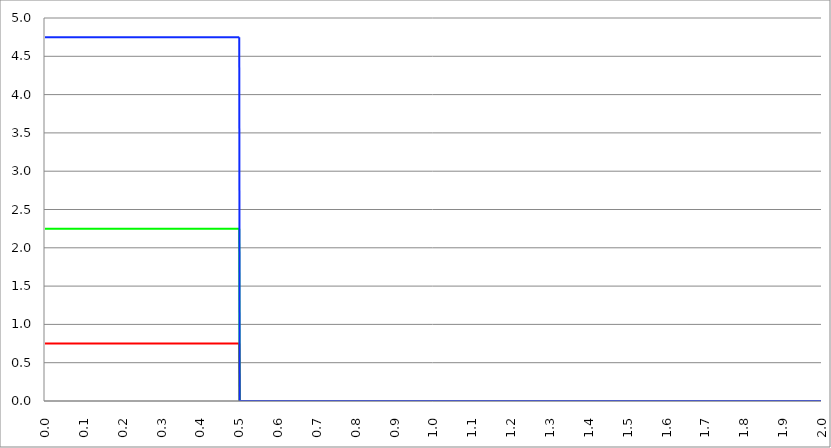
| Category | Series 1 | Series 0 | Series 2 |
|---|---|---|---|
| 0.0 | 0.75 | 2.25 | 4.75 |
| 0.001 | 0.75 | 2.25 | 4.75 |
| 0.002 | 0.75 | 2.25 | 4.75 |
| 0.003 | 0.75 | 2.25 | 4.75 |
| 0.004 | 0.75 | 2.25 | 4.75 |
| 0.005 | 0.75 | 2.25 | 4.75 |
| 0.006 | 0.75 | 2.25 | 4.75 |
| 0.007 | 0.75 | 2.25 | 4.75 |
| 0.008 | 0.75 | 2.25 | 4.75 |
| 0.009 | 0.75 | 2.25 | 4.75 |
| 0.01 | 0.75 | 2.25 | 4.75 |
| 0.011 | 0.75 | 2.25 | 4.75 |
| 0.012 | 0.75 | 2.25 | 4.75 |
| 0.013 | 0.75 | 2.25 | 4.75 |
| 0.014 | 0.75 | 2.25 | 4.75 |
| 0.015 | 0.75 | 2.25 | 4.75 |
| 0.016 | 0.75 | 2.25 | 4.75 |
| 0.017 | 0.75 | 2.25 | 4.75 |
| 0.018 | 0.75 | 2.25 | 4.75 |
| 0.019 | 0.75 | 2.25 | 4.75 |
| 0.02 | 0.75 | 2.25 | 4.75 |
| 0.021 | 0.75 | 2.25 | 4.75 |
| 0.022 | 0.75 | 2.25 | 4.75 |
| 0.023 | 0.75 | 2.25 | 4.75 |
| 0.024 | 0.75 | 2.25 | 4.75 |
| 0.025 | 0.75 | 2.25 | 4.75 |
| 0.026 | 0.75 | 2.25 | 4.75 |
| 0.027 | 0.75 | 2.25 | 4.75 |
| 0.028 | 0.75 | 2.25 | 4.75 |
| 0.029 | 0.75 | 2.25 | 4.75 |
| 0.03 | 0.75 | 2.25 | 4.75 |
| 0.031 | 0.75 | 2.25 | 4.75 |
| 0.032 | 0.75 | 2.25 | 4.75 |
| 0.033 | 0.75 | 2.25 | 4.75 |
| 0.034 | 0.75 | 2.25 | 4.75 |
| 0.035 | 0.75 | 2.25 | 4.75 |
| 0.036 | 0.75 | 2.25 | 4.75 |
| 0.037 | 0.75 | 2.25 | 4.75 |
| 0.038 | 0.75 | 2.25 | 4.75 |
| 0.039 | 0.75 | 2.25 | 4.75 |
| 0.04 | 0.75 | 2.25 | 4.75 |
| 0.041 | 0.75 | 2.25 | 4.75 |
| 0.042 | 0.75 | 2.25 | 4.75 |
| 0.043 | 0.75 | 2.25 | 4.75 |
| 0.044 | 0.75 | 2.25 | 4.75 |
| 0.045 | 0.75 | 2.25 | 4.75 |
| 0.046 | 0.75 | 2.25 | 4.75 |
| 0.047 | 0.75 | 2.25 | 4.75 |
| 0.048 | 0.75 | 2.25 | 4.75 |
| 0.049 | 0.75 | 2.25 | 4.75 |
| 0.05 | 0.75 | 2.25 | 4.75 |
| 0.051 | 0.75 | 2.25 | 4.75 |
| 0.052 | 0.75 | 2.25 | 4.75 |
| 0.053 | 0.75 | 2.25 | 4.75 |
| 0.054 | 0.75 | 2.25 | 4.75 |
| 0.055 | 0.75 | 2.25 | 4.75 |
| 0.056 | 0.75 | 2.25 | 4.75 |
| 0.057 | 0.75 | 2.25 | 4.75 |
| 0.058 | 0.75 | 2.25 | 4.75 |
| 0.059 | 0.75 | 2.25 | 4.75 |
| 0.06 | 0.75 | 2.25 | 4.75 |
| 0.061 | 0.75 | 2.25 | 4.75 |
| 0.062 | 0.75 | 2.25 | 4.75 |
| 0.063 | 0.75 | 2.25 | 4.75 |
| 0.064 | 0.75 | 2.25 | 4.75 |
| 0.065 | 0.75 | 2.25 | 4.75 |
| 0.066 | 0.75 | 2.25 | 4.75 |
| 0.067 | 0.75 | 2.25 | 4.75 |
| 0.068 | 0.75 | 2.25 | 4.75 |
| 0.069 | 0.75 | 2.25 | 4.75 |
| 0.07 | 0.75 | 2.25 | 4.75 |
| 0.071 | 0.75 | 2.25 | 4.75 |
| 0.072 | 0.75 | 2.25 | 4.75 |
| 0.073 | 0.75 | 2.25 | 4.75 |
| 0.074 | 0.75 | 2.25 | 4.75 |
| 0.075 | 0.75 | 2.25 | 4.75 |
| 0.076 | 0.75 | 2.25 | 4.75 |
| 0.077 | 0.75 | 2.25 | 4.75 |
| 0.078 | 0.75 | 2.25 | 4.75 |
| 0.079 | 0.75 | 2.25 | 4.75 |
| 0.08 | 0.75 | 2.25 | 4.75 |
| 0.081 | 0.75 | 2.25 | 4.75 |
| 0.082 | 0.75 | 2.25 | 4.75 |
| 0.083 | 0.75 | 2.25 | 4.75 |
| 0.084 | 0.75 | 2.25 | 4.75 |
| 0.085 | 0.75 | 2.25 | 4.75 |
| 0.086 | 0.75 | 2.25 | 4.75 |
| 0.087 | 0.75 | 2.25 | 4.75 |
| 0.088 | 0.75 | 2.25 | 4.75 |
| 0.089 | 0.75 | 2.25 | 4.75 |
| 0.09 | 0.75 | 2.25 | 4.75 |
| 0.091 | 0.75 | 2.25 | 4.75 |
| 0.092 | 0.75 | 2.25 | 4.75 |
| 0.093 | 0.75 | 2.25 | 4.75 |
| 0.094 | 0.75 | 2.25 | 4.75 |
| 0.095 | 0.75 | 2.25 | 4.75 |
| 0.096 | 0.75 | 2.25 | 4.75 |
| 0.097 | 0.75 | 2.25 | 4.75 |
| 0.098 | 0.75 | 2.25 | 4.75 |
| 0.099 | 0.75 | 2.25 | 4.75 |
| 0.1 | 0.75 | 2.25 | 4.75 |
| 0.101 | 0.75 | 2.25 | 4.75 |
| 0.102 | 0.75 | 2.25 | 4.75 |
| 0.103 | 0.75 | 2.25 | 4.75 |
| 0.104 | 0.75 | 2.25 | 4.75 |
| 0.105 | 0.75 | 2.25 | 4.75 |
| 0.106 | 0.75 | 2.25 | 4.75 |
| 0.107 | 0.75 | 2.25 | 4.75 |
| 0.108 | 0.75 | 2.25 | 4.75 |
| 0.109 | 0.75 | 2.25 | 4.75 |
| 0.11 | 0.75 | 2.25 | 4.75 |
| 0.111 | 0.75 | 2.25 | 4.75 |
| 0.112 | 0.75 | 2.25 | 4.75 |
| 0.113 | 0.75 | 2.25 | 4.75 |
| 0.114 | 0.75 | 2.25 | 4.75 |
| 0.115 | 0.75 | 2.25 | 4.75 |
| 0.116 | 0.75 | 2.25 | 4.75 |
| 0.117 | 0.75 | 2.25 | 4.75 |
| 0.118 | 0.75 | 2.25 | 4.75 |
| 0.119 | 0.75 | 2.25 | 4.75 |
| 0.12 | 0.75 | 2.25 | 4.75 |
| 0.121 | 0.75 | 2.25 | 4.75 |
| 0.122 | 0.75 | 2.25 | 4.75 |
| 0.123 | 0.75 | 2.25 | 4.75 |
| 0.124 | 0.75 | 2.25 | 4.75 |
| 0.125 | 0.75 | 2.25 | 4.75 |
| 0.126 | 0.75 | 2.25 | 4.75 |
| 0.127 | 0.75 | 2.25 | 4.75 |
| 0.128 | 0.75 | 2.25 | 4.75 |
| 0.129 | 0.75 | 2.25 | 4.75 |
| 0.13 | 0.75 | 2.25 | 4.75 |
| 0.131 | 0.75 | 2.25 | 4.75 |
| 0.132 | 0.75 | 2.25 | 4.75 |
| 0.133 | 0.75 | 2.25 | 4.75 |
| 0.134 | 0.75 | 2.25 | 4.75 |
| 0.135 | 0.75 | 2.25 | 4.75 |
| 0.136 | 0.75 | 2.25 | 4.75 |
| 0.137 | 0.75 | 2.25 | 4.75 |
| 0.138 | 0.75 | 2.25 | 4.75 |
| 0.139 | 0.75 | 2.25 | 4.75 |
| 0.14 | 0.75 | 2.25 | 4.75 |
| 0.141 | 0.75 | 2.25 | 4.75 |
| 0.142 | 0.75 | 2.25 | 4.75 |
| 0.143 | 0.75 | 2.25 | 4.75 |
| 0.144 | 0.75 | 2.25 | 4.75 |
| 0.145 | 0.75 | 2.25 | 4.75 |
| 0.146 | 0.75 | 2.25 | 4.75 |
| 0.147 | 0.75 | 2.25 | 4.75 |
| 0.148 | 0.75 | 2.25 | 4.75 |
| 0.149 | 0.75 | 2.25 | 4.75 |
| 0.15 | 0.75 | 2.25 | 4.75 |
| 0.151 | 0.75 | 2.25 | 4.75 |
| 0.152 | 0.75 | 2.25 | 4.75 |
| 0.153 | 0.75 | 2.25 | 4.75 |
| 0.154 | 0.75 | 2.25 | 4.75 |
| 0.155 | 0.75 | 2.25 | 4.75 |
| 0.156 | 0.75 | 2.25 | 4.75 |
| 0.157 | 0.75 | 2.25 | 4.75 |
| 0.158 | 0.75 | 2.25 | 4.75 |
| 0.159 | 0.75 | 2.25 | 4.75 |
| 0.16 | 0.75 | 2.25 | 4.75 |
| 0.161 | 0.75 | 2.25 | 4.75 |
| 0.162 | 0.75 | 2.25 | 4.75 |
| 0.163 | 0.75 | 2.25 | 4.75 |
| 0.164 | 0.75 | 2.25 | 4.75 |
| 0.165 | 0.75 | 2.25 | 4.75 |
| 0.166 | 0.75 | 2.25 | 4.75 |
| 0.167 | 0.75 | 2.25 | 4.75 |
| 0.168 | 0.75 | 2.25 | 4.75 |
| 0.169 | 0.75 | 2.25 | 4.75 |
| 0.17 | 0.75 | 2.25 | 4.75 |
| 0.171 | 0.75 | 2.25 | 4.75 |
| 0.172 | 0.75 | 2.25 | 4.75 |
| 0.173 | 0.75 | 2.25 | 4.75 |
| 0.174 | 0.75 | 2.25 | 4.75 |
| 0.175 | 0.75 | 2.25 | 4.75 |
| 0.176 | 0.75 | 2.25 | 4.75 |
| 0.177 | 0.75 | 2.25 | 4.75 |
| 0.178 | 0.75 | 2.25 | 4.75 |
| 0.179 | 0.75 | 2.25 | 4.75 |
| 0.18 | 0.75 | 2.25 | 4.75 |
| 0.181 | 0.75 | 2.25 | 4.75 |
| 0.182 | 0.75 | 2.25 | 4.75 |
| 0.183 | 0.75 | 2.25 | 4.75 |
| 0.184 | 0.75 | 2.25 | 4.75 |
| 0.185 | 0.75 | 2.25 | 4.75 |
| 0.186 | 0.75 | 2.25 | 4.75 |
| 0.187 | 0.75 | 2.25 | 4.75 |
| 0.188 | 0.75 | 2.25 | 4.75 |
| 0.189 | 0.75 | 2.25 | 4.75 |
| 0.19 | 0.75 | 2.25 | 4.75 |
| 0.191 | 0.75 | 2.25 | 4.75 |
| 0.192 | 0.75 | 2.25 | 4.75 |
| 0.193 | 0.75 | 2.25 | 4.75 |
| 0.194 | 0.75 | 2.25 | 4.75 |
| 0.195 | 0.75 | 2.25 | 4.75 |
| 0.196 | 0.75 | 2.25 | 4.75 |
| 0.197 | 0.75 | 2.25 | 4.75 |
| 0.198 | 0.75 | 2.25 | 4.75 |
| 0.199 | 0.75 | 2.25 | 4.75 |
| 0.2 | 0.75 | 2.25 | 4.75 |
| 0.201 | 0.75 | 2.25 | 4.75 |
| 0.202 | 0.75 | 2.25 | 4.75 |
| 0.203 | 0.75 | 2.25 | 4.75 |
| 0.204 | 0.75 | 2.25 | 4.75 |
| 0.205 | 0.75 | 2.25 | 4.75 |
| 0.206 | 0.75 | 2.25 | 4.75 |
| 0.207 | 0.75 | 2.25 | 4.75 |
| 0.208 | 0.75 | 2.25 | 4.75 |
| 0.209 | 0.75 | 2.25 | 4.75 |
| 0.21 | 0.75 | 2.25 | 4.75 |
| 0.211 | 0.75 | 2.25 | 4.75 |
| 0.212 | 0.75 | 2.25 | 4.75 |
| 0.213 | 0.75 | 2.25 | 4.75 |
| 0.214 | 0.75 | 2.25 | 4.75 |
| 0.215 | 0.75 | 2.25 | 4.75 |
| 0.216 | 0.75 | 2.25 | 4.75 |
| 0.217 | 0.75 | 2.25 | 4.75 |
| 0.218 | 0.75 | 2.25 | 4.75 |
| 0.219 | 0.75 | 2.25 | 4.75 |
| 0.22 | 0.75 | 2.25 | 4.75 |
| 0.221 | 0.75 | 2.25 | 4.75 |
| 0.222 | 0.75 | 2.25 | 4.75 |
| 0.223 | 0.75 | 2.25 | 4.75 |
| 0.224 | 0.75 | 2.25 | 4.75 |
| 0.225 | 0.75 | 2.25 | 4.75 |
| 0.226 | 0.75 | 2.25 | 4.75 |
| 0.227 | 0.75 | 2.25 | 4.75 |
| 0.228 | 0.75 | 2.25 | 4.75 |
| 0.229 | 0.75 | 2.25 | 4.75 |
| 0.23 | 0.75 | 2.25 | 4.75 |
| 0.231 | 0.75 | 2.25 | 4.75 |
| 0.232 | 0.75 | 2.25 | 4.75 |
| 0.233 | 0.75 | 2.25 | 4.75 |
| 0.234 | 0.75 | 2.25 | 4.75 |
| 0.235 | 0.75 | 2.25 | 4.75 |
| 0.236 | 0.75 | 2.25 | 4.75 |
| 0.237 | 0.75 | 2.25 | 4.75 |
| 0.238 | 0.75 | 2.25 | 4.75 |
| 0.239 | 0.75 | 2.25 | 4.75 |
| 0.24 | 0.75 | 2.25 | 4.75 |
| 0.241 | 0.75 | 2.25 | 4.75 |
| 0.242 | 0.75 | 2.25 | 4.75 |
| 0.243 | 0.75 | 2.25 | 4.75 |
| 0.244 | 0.75 | 2.25 | 4.75 |
| 0.245 | 0.75 | 2.25 | 4.75 |
| 0.246 | 0.75 | 2.25 | 4.75 |
| 0.247 | 0.75 | 2.25 | 4.75 |
| 0.248 | 0.75 | 2.25 | 4.75 |
| 0.249 | 0.75 | 2.25 | 4.75 |
| 0.25 | 0.75 | 2.25 | 4.75 |
| 0.251 | 0.75 | 2.25 | 4.75 |
| 0.252 | 0.75 | 2.25 | 4.75 |
| 0.253 | 0.75 | 2.25 | 4.75 |
| 0.254 | 0.75 | 2.25 | 4.75 |
| 0.255 | 0.75 | 2.25 | 4.75 |
| 0.256 | 0.75 | 2.25 | 4.75 |
| 0.257 | 0.75 | 2.25 | 4.75 |
| 0.258 | 0.75 | 2.25 | 4.75 |
| 0.259 | 0.75 | 2.25 | 4.75 |
| 0.26 | 0.75 | 2.25 | 4.75 |
| 0.261 | 0.75 | 2.25 | 4.75 |
| 0.262 | 0.75 | 2.25 | 4.75 |
| 0.263 | 0.75 | 2.25 | 4.75 |
| 0.264 | 0.75 | 2.25 | 4.75 |
| 0.265 | 0.75 | 2.25 | 4.75 |
| 0.266 | 0.75 | 2.25 | 4.75 |
| 0.267 | 0.75 | 2.25 | 4.75 |
| 0.268 | 0.75 | 2.25 | 4.75 |
| 0.269 | 0.75 | 2.25 | 4.75 |
| 0.27 | 0.75 | 2.25 | 4.75 |
| 0.271 | 0.75 | 2.25 | 4.75 |
| 0.272 | 0.75 | 2.25 | 4.75 |
| 0.273 | 0.75 | 2.25 | 4.75 |
| 0.274 | 0.75 | 2.25 | 4.75 |
| 0.275 | 0.75 | 2.25 | 4.75 |
| 0.276 | 0.75 | 2.25 | 4.75 |
| 0.277 | 0.75 | 2.25 | 4.75 |
| 0.278 | 0.75 | 2.25 | 4.75 |
| 0.279 | 0.75 | 2.25 | 4.75 |
| 0.28 | 0.75 | 2.25 | 4.75 |
| 0.281 | 0.75 | 2.25 | 4.75 |
| 0.282 | 0.75 | 2.25 | 4.75 |
| 0.283 | 0.75 | 2.25 | 4.75 |
| 0.284 | 0.75 | 2.25 | 4.75 |
| 0.285 | 0.75 | 2.25 | 4.75 |
| 0.286 | 0.75 | 2.25 | 4.75 |
| 0.287 | 0.75 | 2.25 | 4.75 |
| 0.288 | 0.75 | 2.25 | 4.75 |
| 0.289 | 0.75 | 2.25 | 4.75 |
| 0.29 | 0.75 | 2.25 | 4.75 |
| 0.291 | 0.75 | 2.25 | 4.75 |
| 0.292 | 0.75 | 2.25 | 4.75 |
| 0.293 | 0.75 | 2.25 | 4.75 |
| 0.294 | 0.75 | 2.25 | 4.75 |
| 0.295 | 0.75 | 2.25 | 4.75 |
| 0.296 | 0.75 | 2.25 | 4.75 |
| 0.297 | 0.75 | 2.25 | 4.75 |
| 0.298 | 0.75 | 2.25 | 4.75 |
| 0.299 | 0.75 | 2.25 | 4.75 |
| 0.3 | 0.75 | 2.25 | 4.75 |
| 0.301 | 0.75 | 2.25 | 4.75 |
| 0.302 | 0.75 | 2.25 | 4.75 |
| 0.303 | 0.75 | 2.25 | 4.75 |
| 0.304 | 0.75 | 2.25 | 4.75 |
| 0.305 | 0.75 | 2.25 | 4.75 |
| 0.306 | 0.75 | 2.25 | 4.75 |
| 0.307 | 0.75 | 2.25 | 4.75 |
| 0.308 | 0.75 | 2.25 | 4.75 |
| 0.309 | 0.75 | 2.25 | 4.75 |
| 0.31 | 0.75 | 2.25 | 4.75 |
| 0.311 | 0.75 | 2.25 | 4.75 |
| 0.312 | 0.75 | 2.25 | 4.75 |
| 0.313 | 0.75 | 2.25 | 4.75 |
| 0.314 | 0.75 | 2.25 | 4.75 |
| 0.315 | 0.75 | 2.25 | 4.75 |
| 0.316 | 0.75 | 2.25 | 4.75 |
| 0.317 | 0.75 | 2.25 | 4.75 |
| 0.318 | 0.75 | 2.25 | 4.75 |
| 0.319 | 0.75 | 2.25 | 4.75 |
| 0.32 | 0.75 | 2.25 | 4.75 |
| 0.321 | 0.75 | 2.25 | 4.75 |
| 0.322 | 0.75 | 2.25 | 4.75 |
| 0.323 | 0.75 | 2.25 | 4.75 |
| 0.324 | 0.75 | 2.25 | 4.75 |
| 0.325 | 0.75 | 2.25 | 4.75 |
| 0.326 | 0.75 | 2.25 | 4.75 |
| 0.327 | 0.75 | 2.25 | 4.75 |
| 0.328 | 0.75 | 2.25 | 4.75 |
| 0.329 | 0.75 | 2.25 | 4.75 |
| 0.33 | 0.75 | 2.25 | 4.75 |
| 0.331 | 0.75 | 2.25 | 4.75 |
| 0.332 | 0.75 | 2.25 | 4.75 |
| 0.333 | 0.75 | 2.25 | 4.75 |
| 0.334 | 0.75 | 2.25 | 4.75 |
| 0.335 | 0.75 | 2.25 | 4.75 |
| 0.336 | 0.75 | 2.25 | 4.75 |
| 0.337 | 0.75 | 2.25 | 4.75 |
| 0.338 | 0.75 | 2.25 | 4.75 |
| 0.339 | 0.75 | 2.25 | 4.75 |
| 0.34 | 0.75 | 2.25 | 4.75 |
| 0.341 | 0.75 | 2.25 | 4.75 |
| 0.342 | 0.75 | 2.25 | 4.75 |
| 0.343 | 0.75 | 2.25 | 4.75 |
| 0.344 | 0.75 | 2.25 | 4.75 |
| 0.345 | 0.75 | 2.25 | 4.75 |
| 0.346 | 0.75 | 2.25 | 4.75 |
| 0.347 | 0.75 | 2.25 | 4.75 |
| 0.348 | 0.75 | 2.25 | 4.75 |
| 0.349 | 0.75 | 2.25 | 4.75 |
| 0.35 | 0.75 | 2.25 | 4.75 |
| 0.351 | 0.75 | 2.25 | 4.75 |
| 0.352 | 0.75 | 2.25 | 4.75 |
| 0.353 | 0.75 | 2.25 | 4.75 |
| 0.354 | 0.75 | 2.25 | 4.75 |
| 0.355 | 0.75 | 2.25 | 4.75 |
| 0.356 | 0.75 | 2.25 | 4.75 |
| 0.357 | 0.75 | 2.25 | 4.75 |
| 0.358 | 0.75 | 2.25 | 4.75 |
| 0.359 | 0.75 | 2.25 | 4.75 |
| 0.36 | 0.75 | 2.25 | 4.75 |
| 0.361 | 0.75 | 2.25 | 4.75 |
| 0.362 | 0.75 | 2.25 | 4.75 |
| 0.363 | 0.75 | 2.25 | 4.75 |
| 0.364 | 0.75 | 2.25 | 4.75 |
| 0.365 | 0.75 | 2.25 | 4.75 |
| 0.366 | 0.75 | 2.25 | 4.75 |
| 0.367 | 0.75 | 2.25 | 4.75 |
| 0.368 | 0.75 | 2.25 | 4.75 |
| 0.369 | 0.75 | 2.25 | 4.75 |
| 0.37 | 0.75 | 2.25 | 4.75 |
| 0.371 | 0.75 | 2.25 | 4.75 |
| 0.372 | 0.75 | 2.25 | 4.75 |
| 0.373 | 0.75 | 2.25 | 4.75 |
| 0.374 | 0.75 | 2.25 | 4.75 |
| 0.375 | 0.75 | 2.25 | 4.75 |
| 0.376 | 0.75 | 2.25 | 4.75 |
| 0.377 | 0.75 | 2.25 | 4.75 |
| 0.378 | 0.75 | 2.25 | 4.75 |
| 0.379 | 0.75 | 2.25 | 4.75 |
| 0.38 | 0.75 | 2.25 | 4.75 |
| 0.381 | 0.75 | 2.25 | 4.75 |
| 0.382 | 0.75 | 2.25 | 4.75 |
| 0.383 | 0.75 | 2.25 | 4.75 |
| 0.384 | 0.75 | 2.25 | 4.75 |
| 0.385 | 0.75 | 2.25 | 4.75 |
| 0.386 | 0.75 | 2.25 | 4.75 |
| 0.387 | 0.75 | 2.25 | 4.75 |
| 0.388 | 0.75 | 2.25 | 4.75 |
| 0.389 | 0.75 | 2.25 | 4.75 |
| 0.39 | 0.75 | 2.25 | 4.75 |
| 0.391 | 0.75 | 2.25 | 4.75 |
| 0.392 | 0.75 | 2.25 | 4.75 |
| 0.393 | 0.75 | 2.25 | 4.75 |
| 0.394 | 0.75 | 2.25 | 4.75 |
| 0.395 | 0.75 | 2.25 | 4.75 |
| 0.396 | 0.75 | 2.25 | 4.75 |
| 0.397 | 0.75 | 2.25 | 4.75 |
| 0.398 | 0.75 | 2.25 | 4.75 |
| 0.399 | 0.75 | 2.25 | 4.75 |
| 0.4 | 0.75 | 2.25 | 4.75 |
| 0.401 | 0.75 | 2.25 | 4.75 |
| 0.402 | 0.75 | 2.25 | 4.75 |
| 0.403 | 0.75 | 2.25 | 4.75 |
| 0.404 | 0.75 | 2.25 | 4.75 |
| 0.405 | 0.75 | 2.25 | 4.75 |
| 0.406 | 0.75 | 2.25 | 4.75 |
| 0.407 | 0.75 | 2.25 | 4.75 |
| 0.408 | 0.75 | 2.25 | 4.75 |
| 0.409 | 0.75 | 2.25 | 4.75 |
| 0.41 | 0.75 | 2.25 | 4.75 |
| 0.411 | 0.75 | 2.25 | 4.75 |
| 0.412 | 0.75 | 2.25 | 4.75 |
| 0.413 | 0.75 | 2.25 | 4.75 |
| 0.414 | 0.75 | 2.25 | 4.75 |
| 0.415 | 0.75 | 2.25 | 4.75 |
| 0.416 | 0.75 | 2.25 | 4.75 |
| 0.417 | 0.75 | 2.25 | 4.75 |
| 0.418 | 0.75 | 2.25 | 4.75 |
| 0.419 | 0.75 | 2.25 | 4.75 |
| 0.42 | 0.75 | 2.25 | 4.75 |
| 0.421 | 0.75 | 2.25 | 4.75 |
| 0.422 | 0.75 | 2.25 | 4.75 |
| 0.423 | 0.75 | 2.25 | 4.75 |
| 0.424 | 0.75 | 2.25 | 4.75 |
| 0.425 | 0.75 | 2.25 | 4.75 |
| 0.426 | 0.75 | 2.25 | 4.75 |
| 0.427 | 0.75 | 2.25 | 4.75 |
| 0.428 | 0.75 | 2.25 | 4.75 |
| 0.429 | 0.75 | 2.25 | 4.75 |
| 0.43 | 0.75 | 2.25 | 4.75 |
| 0.431 | 0.75 | 2.25 | 4.75 |
| 0.432 | 0.75 | 2.25 | 4.75 |
| 0.433 | 0.75 | 2.25 | 4.75 |
| 0.434 | 0.75 | 2.25 | 4.75 |
| 0.435 | 0.75 | 2.25 | 4.75 |
| 0.436 | 0.75 | 2.25 | 4.75 |
| 0.437 | 0.75 | 2.25 | 4.75 |
| 0.438 | 0.75 | 2.25 | 4.75 |
| 0.439 | 0.75 | 2.25 | 4.75 |
| 0.44 | 0.75 | 2.25 | 4.75 |
| 0.441 | 0.75 | 2.25 | 4.75 |
| 0.442 | 0.75 | 2.25 | 4.75 |
| 0.443 | 0.75 | 2.25 | 4.75 |
| 0.444 | 0.75 | 2.25 | 4.75 |
| 0.445 | 0.75 | 2.25 | 4.75 |
| 0.446 | 0.75 | 2.25 | 4.75 |
| 0.447 | 0.75 | 2.25 | 4.75 |
| 0.448 | 0.75 | 2.25 | 4.75 |
| 0.449 | 0.75 | 2.25 | 4.75 |
| 0.45 | 0.75 | 2.25 | 4.75 |
| 0.451 | 0.75 | 2.25 | 4.75 |
| 0.452 | 0.75 | 2.25 | 4.75 |
| 0.453 | 0.75 | 2.25 | 4.75 |
| 0.454 | 0.75 | 2.25 | 4.75 |
| 0.455 | 0.75 | 2.25 | 4.75 |
| 0.456 | 0.75 | 2.25 | 4.75 |
| 0.457 | 0.75 | 2.25 | 4.75 |
| 0.458 | 0.75 | 2.25 | 4.75 |
| 0.459 | 0.75 | 2.25 | 4.75 |
| 0.46 | 0.75 | 2.25 | 4.75 |
| 0.461 | 0.75 | 2.25 | 4.75 |
| 0.462 | 0.75 | 2.25 | 4.75 |
| 0.463 | 0.75 | 2.25 | 4.75 |
| 0.464 | 0.75 | 2.25 | 4.75 |
| 0.465 | 0.75 | 2.25 | 4.75 |
| 0.466 | 0.75 | 2.25 | 4.75 |
| 0.467 | 0.75 | 2.25 | 4.75 |
| 0.468 | 0.75 | 2.25 | 4.75 |
| 0.469 | 0.75 | 2.25 | 4.75 |
| 0.47 | 0.75 | 2.25 | 4.75 |
| 0.471 | 0.75 | 2.25 | 4.75 |
| 0.472 | 0.75 | 2.25 | 4.75 |
| 0.473 | 0.75 | 2.25 | 4.75 |
| 0.474 | 0.75 | 2.25 | 4.75 |
| 0.475 | 0.75 | 2.25 | 4.75 |
| 0.476 | 0.75 | 2.25 | 4.75 |
| 0.477 | 0.75 | 2.25 | 4.75 |
| 0.478 | 0.75 | 2.25 | 4.75 |
| 0.479 | 0.75 | 2.25 | 4.75 |
| 0.48 | 0.75 | 2.25 | 4.75 |
| 0.481 | 0.75 | 2.25 | 4.75 |
| 0.482 | 0.75 | 2.25 | 4.75 |
| 0.483 | 0.75 | 2.25 | 4.75 |
| 0.484 | 0.75 | 2.25 | 4.75 |
| 0.485 | 0.75 | 2.25 | 4.75 |
| 0.486 | 0.75 | 2.25 | 4.75 |
| 0.487 | 0.75 | 2.25 | 4.75 |
| 0.488 | 0.75 | 2.25 | 4.75 |
| 0.489 | 0.75 | 2.25 | 4.75 |
| 0.49 | 0.75 | 2.25 | 4.75 |
| 0.491 | 0.75 | 2.25 | 4.75 |
| 0.492 | 0.75 | 2.25 | 4.75 |
| 0.493 | 0.75 | 2.25 | 4.75 |
| 0.494 | 0.75 | 2.25 | 4.75 |
| 0.495 | 0.75 | 2.25 | 4.75 |
| 0.496 | 0.75 | 2.25 | 4.75 |
| 0.497 | 0.75 | 2.25 | 4.75 |
| 0.498 | 0.75 | 2.25 | 4.75 |
| 0.499 | 0.75 | 2.25 | 4.75 |
| 0.5 | 0.75 | 2.25 | 4.75 |
| 0.501 | 0 | 0 | 0 |
| 0.502 | 0 | 0 | 0 |
| 0.503 | 0 | 0 | 0 |
| 0.504 | 0 | 0 | 0 |
| 0.505 | 0 | 0 | 0 |
| 0.506 | 0 | 0 | 0 |
| 0.507 | 0 | 0 | 0 |
| 0.508 | 0 | 0 | 0 |
| 0.509 | 0 | 0 | 0 |
| 0.51 | 0 | 0 | 0 |
| 0.511 | 0 | 0 | 0 |
| 0.512 | 0 | 0 | 0 |
| 0.513 | 0 | 0 | 0 |
| 0.514 | 0 | 0 | 0 |
| 0.515 | 0 | 0 | 0 |
| 0.516 | 0 | 0 | 0 |
| 0.517 | 0 | 0 | 0 |
| 0.518 | 0 | 0 | 0 |
| 0.519 | 0 | 0 | 0 |
| 0.52 | 0 | 0 | 0 |
| 0.521 | 0 | 0 | 0 |
| 0.522 | 0 | 0 | 0 |
| 0.523 | 0 | 0 | 0 |
| 0.524 | 0 | 0 | 0 |
| 0.525 | 0 | 0 | 0 |
| 0.526 | 0 | 0 | 0 |
| 0.527 | 0 | 0 | 0 |
| 0.528 | 0 | 0 | 0 |
| 0.529 | 0 | 0 | 0 |
| 0.53 | 0 | 0 | 0 |
| 0.531 | 0 | 0 | 0 |
| 0.532 | 0 | 0 | 0 |
| 0.533 | 0 | 0 | 0 |
| 0.534 | 0 | 0 | 0 |
| 0.535 | 0 | 0 | 0 |
| 0.536 | 0 | 0 | 0 |
| 0.537 | 0 | 0 | 0 |
| 0.538 | 0 | 0 | 0 |
| 0.539 | 0 | 0 | 0 |
| 0.54 | 0 | 0 | 0 |
| 0.541 | 0 | 0 | 0 |
| 0.542 | 0 | 0 | 0 |
| 0.543 | 0 | 0 | 0 |
| 0.544 | 0 | 0 | 0 |
| 0.545 | 0 | 0 | 0 |
| 0.546 | 0 | 0 | 0 |
| 0.547 | 0 | 0 | 0 |
| 0.548 | 0 | 0 | 0 |
| 0.549 | 0 | 0 | 0 |
| 0.55 | 0 | 0 | 0 |
| 0.551 | 0 | 0 | 0 |
| 0.552 | 0 | 0 | 0 |
| 0.553 | 0 | 0 | 0 |
| 0.554 | 0 | 0 | 0 |
| 0.555 | 0 | 0 | 0 |
| 0.556 | 0 | 0 | 0 |
| 0.557 | 0 | 0 | 0 |
| 0.558 | 0 | 0 | 0 |
| 0.559 | 0 | 0 | 0 |
| 0.56 | 0 | 0 | 0 |
| 0.561 | 0 | 0 | 0 |
| 0.562 | 0 | 0 | 0 |
| 0.563 | 0 | 0 | 0 |
| 0.564 | 0 | 0 | 0 |
| 0.565 | 0 | 0 | 0 |
| 0.566 | 0 | 0 | 0 |
| 0.567 | 0 | 0 | 0 |
| 0.568 | 0 | 0 | 0 |
| 0.569 | 0 | 0 | 0 |
| 0.57 | 0 | 0 | 0 |
| 0.571 | 0 | 0 | 0 |
| 0.572 | 0 | 0 | 0 |
| 0.573 | 0 | 0 | 0 |
| 0.574 | 0 | 0 | 0 |
| 0.575 | 0 | 0 | 0 |
| 0.576 | 0 | 0 | 0 |
| 0.577 | 0 | 0 | 0 |
| 0.578 | 0 | 0 | 0 |
| 0.579 | 0 | 0 | 0 |
| 0.58 | 0 | 0 | 0 |
| 0.581 | 0 | 0 | 0 |
| 0.582 | 0 | 0 | 0 |
| 0.583 | 0 | 0 | 0 |
| 0.584 | 0 | 0 | 0 |
| 0.585 | 0 | 0 | 0 |
| 0.586 | 0 | 0 | 0 |
| 0.587 | 0 | 0 | 0 |
| 0.588 | 0 | 0 | 0 |
| 0.589 | 0 | 0 | 0 |
| 0.59 | 0 | 0 | 0 |
| 0.591 | 0 | 0 | 0 |
| 0.592 | 0 | 0 | 0 |
| 0.593 | 0 | 0 | 0 |
| 0.594 | 0 | 0 | 0 |
| 0.595 | 0 | 0 | 0 |
| 0.596 | 0 | 0 | 0 |
| 0.597 | 0 | 0 | 0 |
| 0.598 | 0 | 0 | 0 |
| 0.599 | 0 | 0 | 0 |
| 0.6 | 0 | 0 | 0 |
| 0.601 | 0 | 0 | 0 |
| 0.602 | 0 | 0 | 0 |
| 0.603 | 0 | 0 | 0 |
| 0.604 | 0 | 0 | 0 |
| 0.605 | 0 | 0 | 0 |
| 0.606 | 0 | 0 | 0 |
| 0.607 | 0 | 0 | 0 |
| 0.608 | 0 | 0 | 0 |
| 0.609 | 0 | 0 | 0 |
| 0.61 | 0 | 0 | 0 |
| 0.611 | 0 | 0 | 0 |
| 0.612 | 0 | 0 | 0 |
| 0.613 | 0 | 0 | 0 |
| 0.614 | 0 | 0 | 0 |
| 0.615 | 0 | 0 | 0 |
| 0.616 | 0 | 0 | 0 |
| 0.617 | 0 | 0 | 0 |
| 0.618 | 0 | 0 | 0 |
| 0.619 | 0 | 0 | 0 |
| 0.62 | 0 | 0 | 0 |
| 0.621 | 0 | 0 | 0 |
| 0.622 | 0 | 0 | 0 |
| 0.623 | 0 | 0 | 0 |
| 0.624 | 0 | 0 | 0 |
| 0.625 | 0 | 0 | 0 |
| 0.626 | 0 | 0 | 0 |
| 0.627 | 0 | 0 | 0 |
| 0.628 | 0 | 0 | 0 |
| 0.629 | 0 | 0 | 0 |
| 0.63 | 0 | 0 | 0 |
| 0.631 | 0 | 0 | 0 |
| 0.632 | 0 | 0 | 0 |
| 0.633 | 0 | 0 | 0 |
| 0.634 | 0 | 0 | 0 |
| 0.635 | 0 | 0 | 0 |
| 0.636 | 0 | 0 | 0 |
| 0.637 | 0 | 0 | 0 |
| 0.638 | 0 | 0 | 0 |
| 0.639 | 0 | 0 | 0 |
| 0.64 | 0 | 0 | 0 |
| 0.641 | 0 | 0 | 0 |
| 0.642 | 0 | 0 | 0 |
| 0.643 | 0 | 0 | 0 |
| 0.644 | 0 | 0 | 0 |
| 0.645 | 0 | 0 | 0 |
| 0.646 | 0 | 0 | 0 |
| 0.647 | 0 | 0 | 0 |
| 0.648 | 0 | 0 | 0 |
| 0.649 | 0 | 0 | 0 |
| 0.65 | 0 | 0 | 0 |
| 0.651 | 0 | 0 | 0 |
| 0.652 | 0 | 0 | 0 |
| 0.653 | 0 | 0 | 0 |
| 0.654 | 0 | 0 | 0 |
| 0.655 | 0 | 0 | 0 |
| 0.656 | 0 | 0 | 0 |
| 0.657 | 0 | 0 | 0 |
| 0.658 | 0 | 0 | 0 |
| 0.659 | 0 | 0 | 0 |
| 0.66 | 0 | 0 | 0 |
| 0.661 | 0 | 0 | 0 |
| 0.662 | 0 | 0 | 0 |
| 0.663 | 0 | 0 | 0 |
| 0.664 | 0 | 0 | 0 |
| 0.665 | 0 | 0 | 0 |
| 0.666 | 0 | 0 | 0 |
| 0.667 | 0 | 0 | 0 |
| 0.668 | 0 | 0 | 0 |
| 0.669 | 0 | 0 | 0 |
| 0.67 | 0 | 0 | 0 |
| 0.671 | 0 | 0 | 0 |
| 0.672 | 0 | 0 | 0 |
| 0.673 | 0 | 0 | 0 |
| 0.674 | 0 | 0 | 0 |
| 0.675 | 0 | 0 | 0 |
| 0.676 | 0 | 0 | 0 |
| 0.677 | 0 | 0 | 0 |
| 0.678 | 0 | 0 | 0 |
| 0.679 | 0 | 0 | 0 |
| 0.68 | 0 | 0 | 0 |
| 0.681 | 0 | 0 | 0 |
| 0.682 | 0 | 0 | 0 |
| 0.683 | 0 | 0 | 0 |
| 0.684 | 0 | 0 | 0 |
| 0.685 | 0 | 0 | 0 |
| 0.686 | 0 | 0 | 0 |
| 0.687 | 0 | 0 | 0 |
| 0.688 | 0 | 0 | 0 |
| 0.689 | 0 | 0 | 0 |
| 0.69 | 0 | 0 | 0 |
| 0.691 | 0 | 0 | 0 |
| 0.692 | 0 | 0 | 0 |
| 0.693 | 0 | 0 | 0 |
| 0.694 | 0 | 0 | 0 |
| 0.695 | 0 | 0 | 0 |
| 0.696 | 0 | 0 | 0 |
| 0.697 | 0 | 0 | 0 |
| 0.698 | 0 | 0 | 0 |
| 0.699 | 0 | 0 | 0 |
| 0.7 | 0 | 0 | 0 |
| 0.701 | 0 | 0 | 0 |
| 0.702 | 0 | 0 | 0 |
| 0.703 | 0 | 0 | 0 |
| 0.704 | 0 | 0 | 0 |
| 0.705 | 0 | 0 | 0 |
| 0.706 | 0 | 0 | 0 |
| 0.707 | 0 | 0 | 0 |
| 0.708 | 0 | 0 | 0 |
| 0.709 | 0 | 0 | 0 |
| 0.71 | 0 | 0 | 0 |
| 0.711 | 0 | 0 | 0 |
| 0.712 | 0 | 0 | 0 |
| 0.713 | 0 | 0 | 0 |
| 0.714 | 0 | 0 | 0 |
| 0.715 | 0 | 0 | 0 |
| 0.716 | 0 | 0 | 0 |
| 0.717 | 0 | 0 | 0 |
| 0.718 | 0 | 0 | 0 |
| 0.719 | 0 | 0 | 0 |
| 0.72 | 0 | 0 | 0 |
| 0.721 | 0 | 0 | 0 |
| 0.722 | 0 | 0 | 0 |
| 0.723 | 0 | 0 | 0 |
| 0.724 | 0 | 0 | 0 |
| 0.725 | 0 | 0 | 0 |
| 0.726 | 0 | 0 | 0 |
| 0.727 | 0 | 0 | 0 |
| 0.728 | 0 | 0 | 0 |
| 0.729 | 0 | 0 | 0 |
| 0.73 | 0 | 0 | 0 |
| 0.731 | 0 | 0 | 0 |
| 0.732 | 0 | 0 | 0 |
| 0.733 | 0 | 0 | 0 |
| 0.734 | 0 | 0 | 0 |
| 0.735 | 0 | 0 | 0 |
| 0.736 | 0 | 0 | 0 |
| 0.737 | 0 | 0 | 0 |
| 0.738 | 0 | 0 | 0 |
| 0.739 | 0 | 0 | 0 |
| 0.74 | 0 | 0 | 0 |
| 0.741 | 0 | 0 | 0 |
| 0.742 | 0 | 0 | 0 |
| 0.743 | 0 | 0 | 0 |
| 0.744 | 0 | 0 | 0 |
| 0.745 | 0 | 0 | 0 |
| 0.746 | 0 | 0 | 0 |
| 0.747 | 0 | 0 | 0 |
| 0.748 | 0 | 0 | 0 |
| 0.749 | 0 | 0 | 0 |
| 0.75 | 0 | 0 | 0 |
| 0.751 | 0 | 0 | 0 |
| 0.752 | 0 | 0 | 0 |
| 0.753 | 0 | 0 | 0 |
| 0.754 | 0 | 0 | 0 |
| 0.755 | 0 | 0 | 0 |
| 0.756 | 0 | 0 | 0 |
| 0.757 | 0 | 0 | 0 |
| 0.758 | 0 | 0 | 0 |
| 0.759 | 0 | 0 | 0 |
| 0.76 | 0 | 0 | 0 |
| 0.761 | 0 | 0 | 0 |
| 0.762 | 0 | 0 | 0 |
| 0.763 | 0 | 0 | 0 |
| 0.764 | 0 | 0 | 0 |
| 0.765 | 0 | 0 | 0 |
| 0.766 | 0 | 0 | 0 |
| 0.767 | 0 | 0 | 0 |
| 0.768 | 0 | 0 | 0 |
| 0.769 | 0 | 0 | 0 |
| 0.77 | 0 | 0 | 0 |
| 0.771000000000001 | 0 | 0 | 0 |
| 0.772000000000001 | 0 | 0 | 0 |
| 0.773000000000001 | 0 | 0 | 0 |
| 0.774000000000001 | 0 | 0 | 0 |
| 0.775000000000001 | 0 | 0 | 0 |
| 0.776000000000001 | 0 | 0 | 0 |
| 0.777000000000001 | 0 | 0 | 0 |
| 0.778000000000001 | 0 | 0 | 0 |
| 0.779000000000001 | 0 | 0 | 0 |
| 0.78 | 0 | 0 | 0 |
| 0.781000000000001 | 0 | 0 | 0 |
| 0.782000000000001 | 0 | 0 | 0 |
| 0.783000000000001 | 0 | 0 | 0 |
| 0.784000000000001 | 0 | 0 | 0 |
| 0.785000000000001 | 0 | 0 | 0 |
| 0.786000000000001 | 0 | 0 | 0 |
| 0.787000000000001 | 0 | 0 | 0 |
| 0.788000000000001 | 0 | 0 | 0 |
| 0.789000000000001 | 0 | 0 | 0 |
| 0.79 | 0 | 0 | 0 |
| 0.791000000000001 | 0 | 0 | 0 |
| 0.792000000000001 | 0 | 0 | 0 |
| 0.793000000000001 | 0 | 0 | 0 |
| 0.794000000000001 | 0 | 0 | 0 |
| 0.795000000000001 | 0 | 0 | 0 |
| 0.796000000000001 | 0 | 0 | 0 |
| 0.797000000000001 | 0 | 0 | 0 |
| 0.798000000000001 | 0 | 0 | 0 |
| 0.799000000000001 | 0 | 0 | 0 |
| 0.800000000000001 | 0 | 0 | 0 |
| 0.801000000000001 | 0 | 0 | 0 |
| 0.802000000000001 | 0 | 0 | 0 |
| 0.803000000000001 | 0 | 0 | 0 |
| 0.804000000000001 | 0 | 0 | 0 |
| 0.805000000000001 | 0 | 0 | 0 |
| 0.806000000000001 | 0 | 0 | 0 |
| 0.807000000000001 | 0 | 0 | 0 |
| 0.808000000000001 | 0 | 0 | 0 |
| 0.809000000000001 | 0 | 0 | 0 |
| 0.810000000000001 | 0 | 0 | 0 |
| 0.811000000000001 | 0 | 0 | 0 |
| 0.812000000000001 | 0 | 0 | 0 |
| 0.813000000000001 | 0 | 0 | 0 |
| 0.814000000000001 | 0 | 0 | 0 |
| 0.815000000000001 | 0 | 0 | 0 |
| 0.816000000000001 | 0 | 0 | 0 |
| 0.817000000000001 | 0 | 0 | 0 |
| 0.818000000000001 | 0 | 0 | 0 |
| 0.819000000000001 | 0 | 0 | 0 |
| 0.820000000000001 | 0 | 0 | 0 |
| 0.821000000000001 | 0 | 0 | 0 |
| 0.822000000000001 | 0 | 0 | 0 |
| 0.823000000000001 | 0 | 0 | 0 |
| 0.824000000000001 | 0 | 0 | 0 |
| 0.825000000000001 | 0 | 0 | 0 |
| 0.826000000000001 | 0 | 0 | 0 |
| 0.827000000000001 | 0 | 0 | 0 |
| 0.828000000000001 | 0 | 0 | 0 |
| 0.829000000000001 | 0 | 0 | 0 |
| 0.830000000000001 | 0 | 0 | 0 |
| 0.831000000000001 | 0 | 0 | 0 |
| 0.832000000000001 | 0 | 0 | 0 |
| 0.833000000000001 | 0 | 0 | 0 |
| 0.834000000000001 | 0 | 0 | 0 |
| 0.835000000000001 | 0 | 0 | 0 |
| 0.836000000000001 | 0 | 0 | 0 |
| 0.837000000000001 | 0 | 0 | 0 |
| 0.838000000000001 | 0 | 0 | 0 |
| 0.839000000000001 | 0 | 0 | 0 |
| 0.840000000000001 | 0 | 0 | 0 |
| 0.841000000000001 | 0 | 0 | 0 |
| 0.842000000000001 | 0 | 0 | 0 |
| 0.843000000000001 | 0 | 0 | 0 |
| 0.844000000000001 | 0 | 0 | 0 |
| 0.845000000000001 | 0 | 0 | 0 |
| 0.846000000000001 | 0 | 0 | 0 |
| 0.847000000000001 | 0 | 0 | 0 |
| 0.848000000000001 | 0 | 0 | 0 |
| 0.849000000000001 | 0 | 0 | 0 |
| 0.850000000000001 | 0 | 0 | 0 |
| 0.851000000000001 | 0 | 0 | 0 |
| 0.852000000000001 | 0 | 0 | 0 |
| 0.853000000000001 | 0 | 0 | 0 |
| 0.854000000000001 | 0 | 0 | 0 |
| 0.855000000000001 | 0 | 0 | 0 |
| 0.856000000000001 | 0 | 0 | 0 |
| 0.857000000000001 | 0 | 0 | 0 |
| 0.858000000000001 | 0 | 0 | 0 |
| 0.859000000000001 | 0 | 0 | 0 |
| 0.860000000000001 | 0 | 0 | 0 |
| 0.861000000000001 | 0 | 0 | 0 |
| 0.862000000000001 | 0 | 0 | 0 |
| 0.863000000000001 | 0 | 0 | 0 |
| 0.864000000000001 | 0 | 0 | 0 |
| 0.865000000000001 | 0 | 0 | 0 |
| 0.866000000000001 | 0 | 0 | 0 |
| 0.867000000000001 | 0 | 0 | 0 |
| 0.868000000000001 | 0 | 0 | 0 |
| 0.869000000000001 | 0 | 0 | 0 |
| 0.870000000000001 | 0 | 0 | 0 |
| 0.871000000000001 | 0 | 0 | 0 |
| 0.872000000000001 | 0 | 0 | 0 |
| 0.873000000000001 | 0 | 0 | 0 |
| 0.874000000000001 | 0 | 0 | 0 |
| 0.875000000000001 | 0 | 0 | 0 |
| 0.876000000000001 | 0 | 0 | 0 |
| 0.877000000000001 | 0 | 0 | 0 |
| 0.878000000000001 | 0 | 0 | 0 |
| 0.879000000000001 | 0 | 0 | 0 |
| 0.880000000000001 | 0 | 0 | 0 |
| 0.881000000000001 | 0 | 0 | 0 |
| 0.882000000000001 | 0 | 0 | 0 |
| 0.883000000000001 | 0 | 0 | 0 |
| 0.884000000000001 | 0 | 0 | 0 |
| 0.885000000000001 | 0 | 0 | 0 |
| 0.886000000000001 | 0 | 0 | 0 |
| 0.887000000000001 | 0 | 0 | 0 |
| 0.888000000000001 | 0 | 0 | 0 |
| 0.889000000000001 | 0 | 0 | 0 |
| 0.890000000000001 | 0 | 0 | 0 |
| 0.891000000000001 | 0 | 0 | 0 |
| 0.892000000000001 | 0 | 0 | 0 |
| 0.893000000000001 | 0 | 0 | 0 |
| 0.894000000000001 | 0 | 0 | 0 |
| 0.895000000000001 | 0 | 0 | 0 |
| 0.896000000000001 | 0 | 0 | 0 |
| 0.897000000000001 | 0 | 0 | 0 |
| 0.898000000000001 | 0 | 0 | 0 |
| 0.899000000000001 | 0 | 0 | 0 |
| 0.900000000000001 | 0 | 0 | 0 |
| 0.901000000000001 | 0 | 0 | 0 |
| 0.902000000000001 | 0 | 0 | 0 |
| 0.903000000000001 | 0 | 0 | 0 |
| 0.904000000000001 | 0 | 0 | 0 |
| 0.905000000000001 | 0 | 0 | 0 |
| 0.906000000000001 | 0 | 0 | 0 |
| 0.907000000000001 | 0 | 0 | 0 |
| 0.908000000000001 | 0 | 0 | 0 |
| 0.909000000000001 | 0 | 0 | 0 |
| 0.910000000000001 | 0 | 0 | 0 |
| 0.911000000000001 | 0 | 0 | 0 |
| 0.912000000000001 | 0 | 0 | 0 |
| 0.913000000000001 | 0 | 0 | 0 |
| 0.914000000000001 | 0 | 0 | 0 |
| 0.915000000000001 | 0 | 0 | 0 |
| 0.916000000000001 | 0 | 0 | 0 |
| 0.917000000000001 | 0 | 0 | 0 |
| 0.918000000000001 | 0 | 0 | 0 |
| 0.919000000000001 | 0 | 0 | 0 |
| 0.920000000000001 | 0 | 0 | 0 |
| 0.921000000000001 | 0 | 0 | 0 |
| 0.922000000000001 | 0 | 0 | 0 |
| 0.923000000000001 | 0 | 0 | 0 |
| 0.924000000000001 | 0 | 0 | 0 |
| 0.925000000000001 | 0 | 0 | 0 |
| 0.926000000000001 | 0 | 0 | 0 |
| 0.927000000000001 | 0 | 0 | 0 |
| 0.928000000000001 | 0 | 0 | 0 |
| 0.929000000000001 | 0 | 0 | 0 |
| 0.930000000000001 | 0 | 0 | 0 |
| 0.931000000000001 | 0 | 0 | 0 |
| 0.932000000000001 | 0 | 0 | 0 |
| 0.933000000000001 | 0 | 0 | 0 |
| 0.934000000000001 | 0 | 0 | 0 |
| 0.935000000000001 | 0 | 0 | 0 |
| 0.936000000000001 | 0 | 0 | 0 |
| 0.937000000000001 | 0 | 0 | 0 |
| 0.938000000000001 | 0 | 0 | 0 |
| 0.939000000000001 | 0 | 0 | 0 |
| 0.940000000000001 | 0 | 0 | 0 |
| 0.941000000000001 | 0 | 0 | 0 |
| 0.942000000000001 | 0 | 0 | 0 |
| 0.943000000000001 | 0 | 0 | 0 |
| 0.944000000000001 | 0 | 0 | 0 |
| 0.945000000000001 | 0 | 0 | 0 |
| 0.946000000000001 | 0 | 0 | 0 |
| 0.947000000000001 | 0 | 0 | 0 |
| 0.948000000000001 | 0 | 0 | 0 |
| 0.949000000000001 | 0 | 0 | 0 |
| 0.950000000000001 | 0 | 0 | 0 |
| 0.951000000000001 | 0 | 0 | 0 |
| 0.952000000000001 | 0 | 0 | 0 |
| 0.953000000000001 | 0 | 0 | 0 |
| 0.954000000000001 | 0 | 0 | 0 |
| 0.955000000000001 | 0 | 0 | 0 |
| 0.956000000000001 | 0 | 0 | 0 |
| 0.957000000000001 | 0 | 0 | 0 |
| 0.958000000000001 | 0 | 0 | 0 |
| 0.959000000000001 | 0 | 0 | 0 |
| 0.960000000000001 | 0 | 0 | 0 |
| 0.961000000000001 | 0 | 0 | 0 |
| 0.962000000000001 | 0 | 0 | 0 |
| 0.963000000000001 | 0 | 0 | 0 |
| 0.964000000000001 | 0 | 0 | 0 |
| 0.965000000000001 | 0 | 0 | 0 |
| 0.966000000000001 | 0 | 0 | 0 |
| 0.967000000000001 | 0 | 0 | 0 |
| 0.968000000000001 | 0 | 0 | 0 |
| 0.969000000000001 | 0 | 0 | 0 |
| 0.970000000000001 | 0 | 0 | 0 |
| 0.971000000000001 | 0 | 0 | 0 |
| 0.972000000000001 | 0 | 0 | 0 |
| 0.973000000000001 | 0 | 0 | 0 |
| 0.974000000000001 | 0 | 0 | 0 |
| 0.975000000000001 | 0 | 0 | 0 |
| 0.976000000000001 | 0 | 0 | 0 |
| 0.977000000000001 | 0 | 0 | 0 |
| 0.978000000000001 | 0 | 0 | 0 |
| 0.979000000000001 | 0 | 0 | 0 |
| 0.980000000000001 | 0 | 0 | 0 |
| 0.981000000000001 | 0 | 0 | 0 |
| 0.982000000000001 | 0 | 0 | 0 |
| 0.983000000000001 | 0 | 0 | 0 |
| 0.984000000000001 | 0 | 0 | 0 |
| 0.985000000000001 | 0 | 0 | 0 |
| 0.986000000000001 | 0 | 0 | 0 |
| 0.987000000000001 | 0 | 0 | 0 |
| 0.988000000000001 | 0 | 0 | 0 |
| 0.989000000000001 | 0 | 0 | 0 |
| 0.990000000000001 | 0 | 0 | 0 |
| 0.991000000000001 | 0 | 0 | 0 |
| 0.992000000000001 | 0 | 0 | 0 |
| 0.993000000000001 | 0 | 0 | 0 |
| 0.994000000000001 | 0 | 0 | 0 |
| 0.995000000000001 | 0 | 0 | 0 |
| 0.996000000000001 | 0 | 0 | 0 |
| 0.997000000000001 | 0 | 0 | 0 |
| 0.998000000000001 | 0 | 0 | 0 |
| 0.999000000000001 | 0 | 0 | 0 |
| 1.000000000000001 | 0 | 0 | 0 |
| 1.001000000000001 | 0 | 0 | 0 |
| 1.002 | 0 | 0 | 0 |
| 1.003 | 0 | 0 | 0 |
| 1.004 | 0 | 0 | 0 |
| 1.005 | 0 | 0 | 0 |
| 1.006 | 0 | 0 | 0 |
| 1.007 | 0 | 0 | 0 |
| 1.008 | 0 | 0 | 0 |
| 1.009 | 0 | 0 | 0 |
| 1.01 | 0 | 0 | 0 |
| 1.010999999999999 | 0 | 0 | 0 |
| 1.011999999999999 | 0 | 0 | 0 |
| 1.012999999999999 | 0 | 0 | 0 |
| 1.013999999999999 | 0 | 0 | 0 |
| 1.014999999999999 | 0 | 0 | 0 |
| 1.015999999999999 | 0 | 0 | 0 |
| 1.016999999999999 | 0 | 0 | 0 |
| 1.017999999999999 | 0 | 0 | 0 |
| 1.018999999999999 | 0 | 0 | 0 |
| 1.019999999999998 | 0 | 0 | 0 |
| 1.020999999999998 | 0 | 0 | 0 |
| 1.021999999999998 | 0 | 0 | 0 |
| 1.022999999999998 | 0 | 0 | 0 |
| 1.023999999999998 | 0 | 0 | 0 |
| 1.024999999999998 | 0 | 0 | 0 |
| 1.025999999999998 | 0 | 0 | 0 |
| 1.026999999999998 | 0 | 0 | 0 |
| 1.027999999999998 | 0 | 0 | 0 |
| 1.028999999999997 | 0 | 0 | 0 |
| 1.029999999999997 | 0 | 0 | 0 |
| 1.030999999999997 | 0 | 0 | 0 |
| 1.031999999999997 | 0 | 0 | 0 |
| 1.032999999999997 | 0 | 0 | 0 |
| 1.033999999999997 | 0 | 0 | 0 |
| 1.034999999999997 | 0 | 0 | 0 |
| 1.035999999999997 | 0 | 0 | 0 |
| 1.036999999999997 | 0 | 0 | 0 |
| 1.037999999999996 | 0 | 0 | 0 |
| 1.038999999999996 | 0 | 0 | 0 |
| 1.039999999999996 | 0 | 0 | 0 |
| 1.040999999999996 | 0 | 0 | 0 |
| 1.041999999999996 | 0 | 0 | 0 |
| 1.042999999999996 | 0 | 0 | 0 |
| 1.043999999999996 | 0 | 0 | 0 |
| 1.044999999999996 | 0 | 0 | 0 |
| 1.045999999999996 | 0 | 0 | 0 |
| 1.046999999999995 | 0 | 0 | 0 |
| 1.047999999999995 | 0 | 0 | 0 |
| 1.048999999999995 | 0 | 0 | 0 |
| 1.049999999999995 | 0 | 0 | 0 |
| 1.050999999999995 | 0 | 0 | 0 |
| 1.051999999999995 | 0 | 0 | 0 |
| 1.052999999999995 | 0 | 0 | 0 |
| 1.053999999999995 | 0 | 0 | 0 |
| 1.054999999999995 | 0 | 0 | 0 |
| 1.055999999999994 | 0 | 0 | 0 |
| 1.056999999999994 | 0 | 0 | 0 |
| 1.057999999999994 | 0 | 0 | 0 |
| 1.058999999999994 | 0 | 0 | 0 |
| 1.059999999999994 | 0 | 0 | 0 |
| 1.060999999999994 | 0 | 0 | 0 |
| 1.061999999999994 | 0 | 0 | 0 |
| 1.062999999999994 | 0 | 0 | 0 |
| 1.063999999999994 | 0 | 0 | 0 |
| 1.064999999999993 | 0 | 0 | 0 |
| 1.065999999999993 | 0 | 0 | 0 |
| 1.066999999999993 | 0 | 0 | 0 |
| 1.067999999999993 | 0 | 0 | 0 |
| 1.068999999999993 | 0 | 0 | 0 |
| 1.069999999999993 | 0 | 0 | 0 |
| 1.070999999999993 | 0 | 0 | 0 |
| 1.071999999999993 | 0 | 0 | 0 |
| 1.072999999999993 | 0 | 0 | 0 |
| 1.073999999999993 | 0 | 0 | 0 |
| 1.074999999999992 | 0 | 0 | 0 |
| 1.075999999999992 | 0 | 0 | 0 |
| 1.076999999999992 | 0 | 0 | 0 |
| 1.077999999999992 | 0 | 0 | 0 |
| 1.078999999999992 | 0 | 0 | 0 |
| 1.079999999999992 | 0 | 0 | 0 |
| 1.080999999999992 | 0 | 0 | 0 |
| 1.081999999999992 | 0 | 0 | 0 |
| 1.082999999999992 | 0 | 0 | 0 |
| 1.083999999999991 | 0 | 0 | 0 |
| 1.084999999999991 | 0 | 0 | 0 |
| 1.085999999999991 | 0 | 0 | 0 |
| 1.086999999999991 | 0 | 0 | 0 |
| 1.087999999999991 | 0 | 0 | 0 |
| 1.088999999999991 | 0 | 0 | 0 |
| 1.089999999999991 | 0 | 0 | 0 |
| 1.090999999999991 | 0 | 0 | 0 |
| 1.091999999999991 | 0 | 0 | 0 |
| 1.09299999999999 | 0 | 0 | 0 |
| 1.09399999999999 | 0 | 0 | 0 |
| 1.09499999999999 | 0 | 0 | 0 |
| 1.09599999999999 | 0 | 0 | 0 |
| 1.09699999999999 | 0 | 0 | 0 |
| 1.09799999999999 | 0 | 0 | 0 |
| 1.09899999999999 | 0 | 0 | 0 |
| 1.09999999999999 | 0 | 0 | 0 |
| 1.10099999999999 | 0 | 0 | 0 |
| 1.101999999999989 | 0 | 0 | 0 |
| 1.102999999999989 | 0 | 0 | 0 |
| 1.103999999999989 | 0 | 0 | 0 |
| 1.104999999999989 | 0 | 0 | 0 |
| 1.105999999999989 | 0 | 0 | 0 |
| 1.106999999999989 | 0 | 0 | 0 |
| 1.107999999999989 | 0 | 0 | 0 |
| 1.108999999999989 | 0 | 0 | 0 |
| 1.109999999999989 | 0 | 0 | 0 |
| 1.110999999999988 | 0 | 0 | 0 |
| 1.111999999999988 | 0 | 0 | 0 |
| 1.112999999999988 | 0 | 0 | 0 |
| 1.113999999999988 | 0 | 0 | 0 |
| 1.114999999999988 | 0 | 0 | 0 |
| 1.115999999999988 | 0 | 0 | 0 |
| 1.116999999999988 | 0 | 0 | 0 |
| 1.117999999999988 | 0 | 0 | 0 |
| 1.118999999999988 | 0 | 0 | 0 |
| 1.119999999999987 | 0 | 0 | 0 |
| 1.120999999999987 | 0 | 0 | 0 |
| 1.121999999999987 | 0 | 0 | 0 |
| 1.122999999999987 | 0 | 0 | 0 |
| 1.123999999999987 | 0 | 0 | 0 |
| 1.124999999999987 | 0 | 0 | 0 |
| 1.125999999999987 | 0 | 0 | 0 |
| 1.126999999999987 | 0 | 0 | 0 |
| 1.127999999999987 | 0 | 0 | 0 |
| 1.128999999999986 | 0 | 0 | 0 |
| 1.129999999999986 | 0 | 0 | 0 |
| 1.130999999999986 | 0 | 0 | 0 |
| 1.131999999999986 | 0 | 0 | 0 |
| 1.132999999999986 | 0 | 0 | 0 |
| 1.133999999999986 | 0 | 0 | 0 |
| 1.134999999999986 | 0 | 0 | 0 |
| 1.135999999999986 | 0 | 0 | 0 |
| 1.136999999999986 | 0 | 0 | 0 |
| 1.137999999999985 | 0 | 0 | 0 |
| 1.138999999999985 | 0 | 0 | 0 |
| 1.139999999999985 | 0 | 0 | 0 |
| 1.140999999999985 | 0 | 0 | 0 |
| 1.141999999999985 | 0 | 0 | 0 |
| 1.142999999999985 | 0 | 0 | 0 |
| 1.143999999999985 | 0 | 0 | 0 |
| 1.144999999999985 | 0 | 0 | 0 |
| 1.145999999999985 | 0 | 0 | 0 |
| 1.146999999999984 | 0 | 0 | 0 |
| 1.147999999999984 | 0 | 0 | 0 |
| 1.148999999999984 | 0 | 0 | 0 |
| 1.149999999999984 | 0 | 0 | 0 |
| 1.150999999999984 | 0 | 0 | 0 |
| 1.151999999999984 | 0 | 0 | 0 |
| 1.152999999999984 | 0 | 0 | 0 |
| 1.153999999999984 | 0 | 0 | 0 |
| 1.154999999999984 | 0 | 0 | 0 |
| 1.155999999999983 | 0 | 0 | 0 |
| 1.156999999999983 | 0 | 0 | 0 |
| 1.157999999999983 | 0 | 0 | 0 |
| 1.158999999999983 | 0 | 0 | 0 |
| 1.159999999999983 | 0 | 0 | 0 |
| 1.160999999999983 | 0 | 0 | 0 |
| 1.161999999999983 | 0 | 0 | 0 |
| 1.162999999999983 | 0 | 0 | 0 |
| 1.163999999999983 | 0 | 0 | 0 |
| 1.164999999999982 | 0 | 0 | 0 |
| 1.165999999999982 | 0 | 0 | 0 |
| 1.166999999999982 | 0 | 0 | 0 |
| 1.167999999999982 | 0 | 0 | 0 |
| 1.168999999999982 | 0 | 0 | 0 |
| 1.169999999999982 | 0 | 0 | 0 |
| 1.170999999999982 | 0 | 0 | 0 |
| 1.171999999999982 | 0 | 0 | 0 |
| 1.172999999999982 | 0 | 0 | 0 |
| 1.173999999999981 | 0 | 0 | 0 |
| 1.174999999999981 | 0 | 0 | 0 |
| 1.175999999999981 | 0 | 0 | 0 |
| 1.176999999999981 | 0 | 0 | 0 |
| 1.177999999999981 | 0 | 0 | 0 |
| 1.178999999999981 | 0 | 0 | 0 |
| 1.179999999999981 | 0 | 0 | 0 |
| 1.180999999999981 | 0 | 0 | 0 |
| 1.181999999999981 | 0 | 0 | 0 |
| 1.18299999999998 | 0 | 0 | 0 |
| 1.18399999999998 | 0 | 0 | 0 |
| 1.18499999999998 | 0 | 0 | 0 |
| 1.18599999999998 | 0 | 0 | 0 |
| 1.18699999999998 | 0 | 0 | 0 |
| 1.18799999999998 | 0 | 0 | 0 |
| 1.18899999999998 | 0 | 0 | 0 |
| 1.18999999999998 | 0 | 0 | 0 |
| 1.19099999999998 | 0 | 0 | 0 |
| 1.191999999999979 | 0 | 0 | 0 |
| 1.192999999999979 | 0 | 0 | 0 |
| 1.193999999999979 | 0 | 0 | 0 |
| 1.194999999999979 | 0 | 0 | 0 |
| 1.195999999999979 | 0 | 0 | 0 |
| 1.196999999999979 | 0 | 0 | 0 |
| 1.197999999999979 | 0 | 0 | 0 |
| 1.198999999999979 | 0 | 0 | 0 |
| 1.199999999999979 | 0 | 0 | 0 |
| 1.200999999999979 | 0 | 0 | 0 |
| 1.201999999999978 | 0 | 0 | 0 |
| 1.202999999999978 | 0 | 0 | 0 |
| 1.203999999999978 | 0 | 0 | 0 |
| 1.204999999999978 | 0 | 0 | 0 |
| 1.205999999999978 | 0 | 0 | 0 |
| 1.206999999999978 | 0 | 0 | 0 |
| 1.207999999999978 | 0 | 0 | 0 |
| 1.208999999999978 | 0 | 0 | 0 |
| 1.209999999999978 | 0 | 0 | 0 |
| 1.210999999999977 | 0 | 0 | 0 |
| 1.211999999999977 | 0 | 0 | 0 |
| 1.212999999999977 | 0 | 0 | 0 |
| 1.213999999999977 | 0 | 0 | 0 |
| 1.214999999999977 | 0 | 0 | 0 |
| 1.215999999999977 | 0 | 0 | 0 |
| 1.216999999999977 | 0 | 0 | 0 |
| 1.217999999999977 | 0 | 0 | 0 |
| 1.218999999999977 | 0 | 0 | 0 |
| 1.219999999999976 | 0 | 0 | 0 |
| 1.220999999999976 | 0 | 0 | 0 |
| 1.221999999999976 | 0 | 0 | 0 |
| 1.222999999999976 | 0 | 0 | 0 |
| 1.223999999999976 | 0 | 0 | 0 |
| 1.224999999999976 | 0 | 0 | 0 |
| 1.225999999999976 | 0 | 0 | 0 |
| 1.226999999999976 | 0 | 0 | 0 |
| 1.227999999999976 | 0 | 0 | 0 |
| 1.228999999999975 | 0 | 0 | 0 |
| 1.229999999999975 | 0 | 0 | 0 |
| 1.230999999999975 | 0 | 0 | 0 |
| 1.231999999999975 | 0 | 0 | 0 |
| 1.232999999999975 | 0 | 0 | 0 |
| 1.233999999999975 | 0 | 0 | 0 |
| 1.234999999999975 | 0 | 0 | 0 |
| 1.235999999999975 | 0 | 0 | 0 |
| 1.236999999999975 | 0 | 0 | 0 |
| 1.237999999999974 | 0 | 0 | 0 |
| 1.238999999999974 | 0 | 0 | 0 |
| 1.239999999999974 | 0 | 0 | 0 |
| 1.240999999999974 | 0 | 0 | 0 |
| 1.241999999999974 | 0 | 0 | 0 |
| 1.242999999999974 | 0 | 0 | 0 |
| 1.243999999999974 | 0 | 0 | 0 |
| 1.244999999999974 | 0 | 0 | 0 |
| 1.245999999999974 | 0 | 0 | 0 |
| 1.246999999999973 | 0 | 0 | 0 |
| 1.247999999999973 | 0 | 0 | 0 |
| 1.248999999999973 | 0 | 0 | 0 |
| 1.249999999999973 | 0 | 0 | 0 |
| 1.250999999999973 | 0 | 0 | 0 |
| 1.251999999999973 | 0 | 0 | 0 |
| 1.252999999999973 | 0 | 0 | 0 |
| 1.253999999999973 | 0 | 0 | 0 |
| 1.254999999999973 | 0 | 0 | 0 |
| 1.255999999999972 | 0 | 0 | 0 |
| 1.256999999999972 | 0 | 0 | 0 |
| 1.257999999999972 | 0 | 0 | 0 |
| 1.258999999999972 | 0 | 0 | 0 |
| 1.259999999999972 | 0 | 0 | 0 |
| 1.260999999999972 | 0 | 0 | 0 |
| 1.261999999999972 | 0 | 0 | 0 |
| 1.262999999999972 | 0 | 0 | 0 |
| 1.263999999999972 | 0 | 0 | 0 |
| 1.264999999999971 | 0 | 0 | 0 |
| 1.265999999999971 | 0 | 0 | 0 |
| 1.266999999999971 | 0 | 0 | 0 |
| 1.267999999999971 | 0 | 0 | 0 |
| 1.268999999999971 | 0 | 0 | 0 |
| 1.269999999999971 | 0 | 0 | 0 |
| 1.270999999999971 | 0 | 0 | 0 |
| 1.271999999999971 | 0 | 0 | 0 |
| 1.272999999999971 | 0 | 0 | 0 |
| 1.27399999999997 | 0 | 0 | 0 |
| 1.27499999999997 | 0 | 0 | 0 |
| 1.27599999999997 | 0 | 0 | 0 |
| 1.27699999999997 | 0 | 0 | 0 |
| 1.27799999999997 | 0 | 0 | 0 |
| 1.27899999999997 | 0 | 0 | 0 |
| 1.27999999999997 | 0 | 0 | 0 |
| 1.28099999999997 | 0 | 0 | 0 |
| 1.28199999999997 | 0 | 0 | 0 |
| 1.282999999999969 | 0 | 0 | 0 |
| 1.283999999999969 | 0 | 0 | 0 |
| 1.284999999999969 | 0 | 0 | 0 |
| 1.285999999999969 | 0 | 0 | 0 |
| 1.286999999999969 | 0 | 0 | 0 |
| 1.287999999999969 | 0 | 0 | 0 |
| 1.288999999999969 | 0 | 0 | 0 |
| 1.289999999999969 | 0 | 0 | 0 |
| 1.290999999999969 | 0 | 0 | 0 |
| 1.291999999999968 | 0 | 0 | 0 |
| 1.292999999999968 | 0 | 0 | 0 |
| 1.293999999999968 | 0 | 0 | 0 |
| 1.294999999999968 | 0 | 0 | 0 |
| 1.295999999999968 | 0 | 0 | 0 |
| 1.296999999999968 | 0 | 0 | 0 |
| 1.297999999999968 | 0 | 0 | 0 |
| 1.298999999999968 | 0 | 0 | 0 |
| 1.299999999999968 | 0 | 0 | 0 |
| 1.300999999999967 | 0 | 0 | 0 |
| 1.301999999999967 | 0 | 0 | 0 |
| 1.302999999999967 | 0 | 0 | 0 |
| 1.303999999999967 | 0 | 0 | 0 |
| 1.304999999999967 | 0 | 0 | 0 |
| 1.305999999999967 | 0 | 0 | 0 |
| 1.306999999999967 | 0 | 0 | 0 |
| 1.307999999999967 | 0 | 0 | 0 |
| 1.308999999999967 | 0 | 0 | 0 |
| 1.309999999999966 | 0 | 0 | 0 |
| 1.310999999999966 | 0 | 0 | 0 |
| 1.311999999999966 | 0 | 0 | 0 |
| 1.312999999999966 | 0 | 0 | 0 |
| 1.313999999999966 | 0 | 0 | 0 |
| 1.314999999999966 | 0 | 0 | 0 |
| 1.315999999999966 | 0 | 0 | 0 |
| 1.316999999999966 | 0 | 0 | 0 |
| 1.317999999999966 | 0 | 0 | 0 |
| 1.318999999999965 | 0 | 0 | 0 |
| 1.319999999999965 | 0 | 0 | 0 |
| 1.320999999999965 | 0 | 0 | 0 |
| 1.321999999999965 | 0 | 0 | 0 |
| 1.322999999999965 | 0 | 0 | 0 |
| 1.323999999999965 | 0 | 0 | 0 |
| 1.324999999999965 | 0 | 0 | 0 |
| 1.325999999999965 | 0 | 0 | 0 |
| 1.326999999999965 | 0 | 0 | 0 |
| 1.327999999999964 | 0 | 0 | 0 |
| 1.328999999999964 | 0 | 0 | 0 |
| 1.329999999999964 | 0 | 0 | 0 |
| 1.330999999999964 | 0 | 0 | 0 |
| 1.331999999999964 | 0 | 0 | 0 |
| 1.332999999999964 | 0 | 0 | 0 |
| 1.333999999999964 | 0 | 0 | 0 |
| 1.334999999999964 | 0 | 0 | 0 |
| 1.335999999999964 | 0 | 0 | 0 |
| 1.336999999999963 | 0 | 0 | 0 |
| 1.337999999999963 | 0 | 0 | 0 |
| 1.338999999999963 | 0 | 0 | 0 |
| 1.339999999999963 | 0 | 0 | 0 |
| 1.340999999999963 | 0 | 0 | 0 |
| 1.341999999999963 | 0 | 0 | 0 |
| 1.342999999999963 | 0 | 0 | 0 |
| 1.343999999999963 | 0 | 0 | 0 |
| 1.344999999999963 | 0 | 0 | 0 |
| 1.345999999999963 | 0 | 0 | 0 |
| 1.346999999999962 | 0 | 0 | 0 |
| 1.347999999999962 | 0 | 0 | 0 |
| 1.348999999999962 | 0 | 0 | 0 |
| 1.349999999999962 | 0 | 0 | 0 |
| 1.350999999999962 | 0 | 0 | 0 |
| 1.351999999999962 | 0 | 0 | 0 |
| 1.352999999999962 | 0 | 0 | 0 |
| 1.353999999999962 | 0 | 0 | 0 |
| 1.354999999999962 | 0 | 0 | 0 |
| 1.355999999999961 | 0 | 0 | 0 |
| 1.356999999999961 | 0 | 0 | 0 |
| 1.357999999999961 | 0 | 0 | 0 |
| 1.358999999999961 | 0 | 0 | 0 |
| 1.359999999999961 | 0 | 0 | 0 |
| 1.360999999999961 | 0 | 0 | 0 |
| 1.361999999999961 | 0 | 0 | 0 |
| 1.362999999999961 | 0 | 0 | 0 |
| 1.363999999999961 | 0 | 0 | 0 |
| 1.36499999999996 | 0 | 0 | 0 |
| 1.36599999999996 | 0 | 0 | 0 |
| 1.36699999999996 | 0 | 0 | 0 |
| 1.36799999999996 | 0 | 0 | 0 |
| 1.36899999999996 | 0 | 0 | 0 |
| 1.36999999999996 | 0 | 0 | 0 |
| 1.37099999999996 | 0 | 0 | 0 |
| 1.37199999999996 | 0 | 0 | 0 |
| 1.37299999999996 | 0 | 0 | 0 |
| 1.373999999999959 | 0 | 0 | 0 |
| 1.374999999999959 | 0 | 0 | 0 |
| 1.375999999999959 | 0 | 0 | 0 |
| 1.376999999999959 | 0 | 0 | 0 |
| 1.377999999999959 | 0 | 0 | 0 |
| 1.378999999999959 | 0 | 0 | 0 |
| 1.379999999999959 | 0 | 0 | 0 |
| 1.380999999999959 | 0 | 0 | 0 |
| 1.381999999999959 | 0 | 0 | 0 |
| 1.382999999999958 | 0 | 0 | 0 |
| 1.383999999999958 | 0 | 0 | 0 |
| 1.384999999999958 | 0 | 0 | 0 |
| 1.385999999999958 | 0 | 0 | 0 |
| 1.386999999999958 | 0 | 0 | 0 |
| 1.387999999999958 | 0 | 0 | 0 |
| 1.388999999999958 | 0 | 0 | 0 |
| 1.389999999999958 | 0 | 0 | 0 |
| 1.390999999999958 | 0 | 0 | 0 |
| 1.391999999999957 | 0 | 0 | 0 |
| 1.392999999999957 | 0 | 0 | 0 |
| 1.393999999999957 | 0 | 0 | 0 |
| 1.394999999999957 | 0 | 0 | 0 |
| 1.395999999999957 | 0 | 0 | 0 |
| 1.396999999999957 | 0 | 0 | 0 |
| 1.397999999999957 | 0 | 0 | 0 |
| 1.398999999999957 | 0 | 0 | 0 |
| 1.399999999999957 | 0 | 0 | 0 |
| 1.400999999999956 | 0 | 0 | 0 |
| 1.401999999999956 | 0 | 0 | 0 |
| 1.402999999999956 | 0 | 0 | 0 |
| 1.403999999999956 | 0 | 0 | 0 |
| 1.404999999999956 | 0 | 0 | 0 |
| 1.405999999999956 | 0 | 0 | 0 |
| 1.406999999999956 | 0 | 0 | 0 |
| 1.407999999999956 | 0 | 0 | 0 |
| 1.408999999999956 | 0 | 0 | 0 |
| 1.409999999999955 | 0 | 0 | 0 |
| 1.410999999999955 | 0 | 0 | 0 |
| 1.411999999999955 | 0 | 0 | 0 |
| 1.412999999999955 | 0 | 0 | 0 |
| 1.413999999999955 | 0 | 0 | 0 |
| 1.414999999999955 | 0 | 0 | 0 |
| 1.415999999999955 | 0 | 0 | 0 |
| 1.416999999999955 | 0 | 0 | 0 |
| 1.417999999999955 | 0 | 0 | 0 |
| 1.418999999999954 | 0 | 0 | 0 |
| 1.419999999999954 | 0 | 0 | 0 |
| 1.420999999999954 | 0 | 0 | 0 |
| 1.421999999999954 | 0 | 0 | 0 |
| 1.422999999999954 | 0 | 0 | 0 |
| 1.423999999999954 | 0 | 0 | 0 |
| 1.424999999999954 | 0 | 0 | 0 |
| 1.425999999999954 | 0 | 0 | 0 |
| 1.426999999999954 | 0 | 0 | 0 |
| 1.427999999999954 | 0 | 0 | 0 |
| 1.428999999999953 | 0 | 0 | 0 |
| 1.429999999999953 | 0 | 0 | 0 |
| 1.430999999999953 | 0 | 0 | 0 |
| 1.431999999999953 | 0 | 0 | 0 |
| 1.432999999999953 | 0 | 0 | 0 |
| 1.433999999999953 | 0 | 0 | 0 |
| 1.434999999999953 | 0 | 0 | 0 |
| 1.435999999999953 | 0 | 0 | 0 |
| 1.436999999999953 | 0 | 0 | 0 |
| 1.437999999999952 | 0 | 0 | 0 |
| 1.438999999999952 | 0 | 0 | 0 |
| 1.439999999999952 | 0 | 0 | 0 |
| 1.440999999999952 | 0 | 0 | 0 |
| 1.441999999999952 | 0 | 0 | 0 |
| 1.442999999999952 | 0 | 0 | 0 |
| 1.443999999999952 | 0 | 0 | 0 |
| 1.444999999999952 | 0 | 0 | 0 |
| 1.445999999999952 | 0 | 0 | 0 |
| 1.446999999999951 | 0 | 0 | 0 |
| 1.447999999999951 | 0 | 0 | 0 |
| 1.448999999999951 | 0 | 0 | 0 |
| 1.449999999999951 | 0 | 0 | 0 |
| 1.450999999999951 | 0 | 0 | 0 |
| 1.451999999999951 | 0 | 0 | 0 |
| 1.452999999999951 | 0 | 0 | 0 |
| 1.453999999999951 | 0 | 0 | 0 |
| 1.454999999999951 | 0 | 0 | 0 |
| 1.45599999999995 | 0 | 0 | 0 |
| 1.45699999999995 | 0 | 0 | 0 |
| 1.45799999999995 | 0 | 0 | 0 |
| 1.45899999999995 | 0 | 0 | 0 |
| 1.45999999999995 | 0 | 0 | 0 |
| 1.46099999999995 | 0 | 0 | 0 |
| 1.46199999999995 | 0 | 0 | 0 |
| 1.46299999999995 | 0 | 0 | 0 |
| 1.46399999999995 | 0 | 0 | 0 |
| 1.464999999999949 | 0 | 0 | 0 |
| 1.465999999999949 | 0 | 0 | 0 |
| 1.466999999999949 | 0 | 0 | 0 |
| 1.467999999999949 | 0 | 0 | 0 |
| 1.468999999999949 | 0 | 0 | 0 |
| 1.469999999999949 | 0 | 0 | 0 |
| 1.470999999999949 | 0 | 0 | 0 |
| 1.471999999999949 | 0 | 0 | 0 |
| 1.472999999999949 | 0 | 0 | 0 |
| 1.473999999999948 | 0 | 0 | 0 |
| 1.474999999999948 | 0 | 0 | 0 |
| 1.475999999999948 | 0 | 0 | 0 |
| 1.476999999999948 | 0 | 0 | 0 |
| 1.477999999999948 | 0 | 0 | 0 |
| 1.478999999999948 | 0 | 0 | 0 |
| 1.479999999999948 | 0 | 0 | 0 |
| 1.480999999999948 | 0 | 0 | 0 |
| 1.481999999999948 | 0 | 0 | 0 |
| 1.482999999999947 | 0 | 0 | 0 |
| 1.483999999999947 | 0 | 0 | 0 |
| 1.484999999999947 | 0 | 0 | 0 |
| 1.485999999999947 | 0 | 0 | 0 |
| 1.486999999999947 | 0 | 0 | 0 |
| 1.487999999999947 | 0 | 0 | 0 |
| 1.488999999999947 | 0 | 0 | 0 |
| 1.489999999999947 | 0 | 0 | 0 |
| 1.490999999999947 | 0 | 0 | 0 |
| 1.491999999999946 | 0 | 0 | 0 |
| 1.492999999999946 | 0 | 0 | 0 |
| 1.493999999999946 | 0 | 0 | 0 |
| 1.494999999999946 | 0 | 0 | 0 |
| 1.495999999999946 | 0 | 0 | 0 |
| 1.496999999999946 | 0 | 0 | 0 |
| 1.497999999999946 | 0 | 0 | 0 |
| 1.498999999999946 | 0 | 0 | 0 |
| 1.499999999999946 | 0 | 0 | 0 |
| 1.500999999999945 | 0 | 0 | 0 |
| 1.501999999999945 | 0 | 0 | 0 |
| 1.502999999999945 | 0 | 0 | 0 |
| 1.503999999999945 | 0 | 0 | 0 |
| 1.504999999999945 | 0 | 0 | 0 |
| 1.505999999999945 | 0 | 0 | 0 |
| 1.506999999999945 | 0 | 0 | 0 |
| 1.507999999999945 | 0 | 0 | 0 |
| 1.508999999999945 | 0 | 0 | 0 |
| 1.509999999999944 | 0 | 0 | 0 |
| 1.510999999999944 | 0 | 0 | 0 |
| 1.511999999999944 | 0 | 0 | 0 |
| 1.512999999999944 | 0 | 0 | 0 |
| 1.513999999999944 | 0 | 0 | 0 |
| 1.514999999999944 | 0 | 0 | 0 |
| 1.515999999999944 | 0 | 0 | 0 |
| 1.516999999999944 | 0 | 0 | 0 |
| 1.517999999999944 | 0 | 0 | 0 |
| 1.518999999999944 | 0 | 0 | 0 |
| 1.519999999999943 | 0 | 0 | 0 |
| 1.520999999999943 | 0 | 0 | 0 |
| 1.521999999999943 | 0 | 0 | 0 |
| 1.522999999999943 | 0 | 0 | 0 |
| 1.523999999999943 | 0 | 0 | 0 |
| 1.524999999999943 | 0 | 0 | 0 |
| 1.525999999999943 | 0 | 0 | 0 |
| 1.526999999999943 | 0 | 0 | 0 |
| 1.527999999999943 | 0 | 0 | 0 |
| 1.528999999999942 | 0 | 0 | 0 |
| 1.529999999999942 | 0 | 0 | 0 |
| 1.530999999999942 | 0 | 0 | 0 |
| 1.531999999999942 | 0 | 0 | 0 |
| 1.532999999999942 | 0 | 0 | 0 |
| 1.533999999999942 | 0 | 0 | 0 |
| 1.534999999999942 | 0 | 0 | 0 |
| 1.535999999999942 | 0 | 0 | 0 |
| 1.536999999999942 | 0 | 0 | 0 |
| 1.537999999999941 | 0 | 0 | 0 |
| 1.538999999999941 | 0 | 0 | 0 |
| 1.539999999999941 | 0 | 0 | 0 |
| 1.540999999999941 | 0 | 0 | 0 |
| 1.541999999999941 | 0 | 0 | 0 |
| 1.542999999999941 | 0 | 0 | 0 |
| 1.543999999999941 | 0 | 0 | 0 |
| 1.544999999999941 | 0 | 0 | 0 |
| 1.545999999999941 | 0 | 0 | 0 |
| 1.54699999999994 | 0 | 0 | 0 |
| 1.54799999999994 | 0 | 0 | 0 |
| 1.54899999999994 | 0 | 0 | 0 |
| 1.54999999999994 | 0 | 0 | 0 |
| 1.55099999999994 | 0 | 0 | 0 |
| 1.55199999999994 | 0 | 0 | 0 |
| 1.55299999999994 | 0 | 0 | 0 |
| 1.55399999999994 | 0 | 0 | 0 |
| 1.55499999999994 | 0 | 0 | 0 |
| 1.555999999999939 | 0 | 0 | 0 |
| 1.556999999999939 | 0 | 0 | 0 |
| 1.557999999999939 | 0 | 0 | 0 |
| 1.558999999999939 | 0 | 0 | 0 |
| 1.559999999999939 | 0 | 0 | 0 |
| 1.560999999999939 | 0 | 0 | 0 |
| 1.561999999999939 | 0 | 0 | 0 |
| 1.562999999999939 | 0 | 0 | 0 |
| 1.563999999999939 | 0 | 0 | 0 |
| 1.564999999999938 | 0 | 0 | 0 |
| 1.565999999999938 | 0 | 0 | 0 |
| 1.566999999999938 | 0 | 0 | 0 |
| 1.567999999999938 | 0 | 0 | 0 |
| 1.568999999999938 | 0 | 0 | 0 |
| 1.569999999999938 | 0 | 0 | 0 |
| 1.570999999999938 | 0 | 0 | 0 |
| 1.571999999999938 | 0 | 0 | 0 |
| 1.572999999999938 | 0 | 0 | 0 |
| 1.573999999999937 | 0 | 0 | 0 |
| 1.574999999999937 | 0 | 0 | 0 |
| 1.575999999999937 | 0 | 0 | 0 |
| 1.576999999999937 | 0 | 0 | 0 |
| 1.577999999999937 | 0 | 0 | 0 |
| 1.578999999999937 | 0 | 0 | 0 |
| 1.579999999999937 | 0 | 0 | 0 |
| 1.580999999999937 | 0 | 0 | 0 |
| 1.581999999999937 | 0 | 0 | 0 |
| 1.582999999999936 | 0 | 0 | 0 |
| 1.583999999999936 | 0 | 0 | 0 |
| 1.584999999999936 | 0 | 0 | 0 |
| 1.585999999999936 | 0 | 0 | 0 |
| 1.586999999999936 | 0 | 0 | 0 |
| 1.587999999999936 | 0 | 0 | 0 |
| 1.588999999999936 | 0 | 0 | 0 |
| 1.589999999999936 | 0 | 0 | 0 |
| 1.590999999999936 | 0 | 0 | 0 |
| 1.591999999999935 | 0 | 0 | 0 |
| 1.592999999999935 | 0 | 0 | 0 |
| 1.593999999999935 | 0 | 0 | 0 |
| 1.594999999999935 | 0 | 0 | 0 |
| 1.595999999999935 | 0 | 0 | 0 |
| 1.596999999999935 | 0 | 0 | 0 |
| 1.597999999999935 | 0 | 0 | 0 |
| 1.598999999999935 | 0 | 0 | 0 |
| 1.599999999999935 | 0 | 0 | 0 |
| 1.600999999999934 | 0 | 0 | 0 |
| 1.601999999999934 | 0 | 0 | 0 |
| 1.602999999999934 | 0 | 0 | 0 |
| 1.603999999999934 | 0 | 0 | 0 |
| 1.604999999999934 | 0 | 0 | 0 |
| 1.605999999999934 | 0 | 0 | 0 |
| 1.606999999999934 | 0 | 0 | 0 |
| 1.607999999999934 | 0 | 0 | 0 |
| 1.608999999999934 | 0 | 0 | 0 |
| 1.609999999999933 | 0 | 0 | 0 |
| 1.610999999999933 | 0 | 0 | 0 |
| 1.611999999999933 | 0 | 0 | 0 |
| 1.612999999999933 | 0 | 0 | 0 |
| 1.613999999999933 | 0 | 0 | 0 |
| 1.614999999999933 | 0 | 0 | 0 |
| 1.615999999999933 | 0 | 0 | 0 |
| 1.616999999999933 | 0 | 0 | 0 |
| 1.617999999999933 | 0 | 0 | 0 |
| 1.618999999999932 | 0 | 0 | 0 |
| 1.619999999999932 | 0 | 0 | 0 |
| 1.620999999999932 | 0 | 0 | 0 |
| 1.621999999999932 | 0 | 0 | 0 |
| 1.622999999999932 | 0 | 0 | 0 |
| 1.623999999999932 | 0 | 0 | 0 |
| 1.624999999999932 | 0 | 0 | 0 |
| 1.625999999999932 | 0 | 0 | 0 |
| 1.626999999999932 | 0 | 0 | 0 |
| 1.627999999999931 | 0 | 0 | 0 |
| 1.628999999999931 | 0 | 0 | 0 |
| 1.629999999999931 | 0 | 0 | 0 |
| 1.630999999999931 | 0 | 0 | 0 |
| 1.631999999999931 | 0 | 0 | 0 |
| 1.632999999999931 | 0 | 0 | 0 |
| 1.633999999999931 | 0 | 0 | 0 |
| 1.634999999999931 | 0 | 0 | 0 |
| 1.635999999999931 | 0 | 0 | 0 |
| 1.63699999999993 | 0 | 0 | 0 |
| 1.63799999999993 | 0 | 0 | 0 |
| 1.63899999999993 | 0 | 0 | 0 |
| 1.63999999999993 | 0 | 0 | 0 |
| 1.64099999999993 | 0 | 0 | 0 |
| 1.64199999999993 | 0 | 0 | 0 |
| 1.64299999999993 | 0 | 0 | 0 |
| 1.64399999999993 | 0 | 0 | 0 |
| 1.64499999999993 | 0 | 0 | 0 |
| 1.645999999999929 | 0 | 0 | 0 |
| 1.646999999999929 | 0 | 0 | 0 |
| 1.647999999999929 | 0 | 0 | 0 |
| 1.648999999999929 | 0 | 0 | 0 |
| 1.649999999999929 | 0 | 0 | 0 |
| 1.650999999999929 | 0 | 0 | 0 |
| 1.651999999999929 | 0 | 0 | 0 |
| 1.652999999999929 | 0 | 0 | 0 |
| 1.653999999999929 | 0 | 0 | 0 |
| 1.654999999999928 | 0 | 0 | 0 |
| 1.655999999999928 | 0 | 0 | 0 |
| 1.656999999999928 | 0 | 0 | 0 |
| 1.657999999999928 | 0 | 0 | 0 |
| 1.658999999999928 | 0 | 0 | 0 |
| 1.659999999999928 | 0 | 0 | 0 |
| 1.660999999999928 | 0 | 0 | 0 |
| 1.661999999999928 | 0 | 0 | 0 |
| 1.662999999999928 | 0 | 0 | 0 |
| 1.663999999999927 | 0 | 0 | 0 |
| 1.664999999999927 | 0 | 0 | 0 |
| 1.665999999999927 | 0 | 0 | 0 |
| 1.666999999999927 | 0 | 0 | 0 |
| 1.667999999999927 | 0 | 0 | 0 |
| 1.668999999999927 | 0 | 0 | 0 |
| 1.669999999999927 | 0 | 0 | 0 |
| 1.670999999999927 | 0 | 0 | 0 |
| 1.671999999999927 | 0 | 0 | 0 |
| 1.672999999999926 | 0 | 0 | 0 |
| 1.673999999999926 | 0 | 0 | 0 |
| 1.674999999999926 | 0 | 0 | 0 |
| 1.675999999999926 | 0 | 0 | 0 |
| 1.676999999999926 | 0 | 0 | 0 |
| 1.677999999999926 | 0 | 0 | 0 |
| 1.678999999999926 | 0 | 0 | 0 |
| 1.679999999999926 | 0 | 0 | 0 |
| 1.680999999999926 | 0 | 0 | 0 |
| 1.681999999999925 | 0 | 0 | 0 |
| 1.682999999999925 | 0 | 0 | 0 |
| 1.683999999999925 | 0 | 0 | 0 |
| 1.684999999999925 | 0 | 0 | 0 |
| 1.685999999999925 | 0 | 0 | 0 |
| 1.686999999999925 | 0 | 0 | 0 |
| 1.687999999999925 | 0 | 0 | 0 |
| 1.688999999999925 | 0 | 0 | 0 |
| 1.689999999999925 | 0 | 0 | 0 |
| 1.690999999999924 | 0 | 0 | 0 |
| 1.691999999999924 | 0 | 0 | 0 |
| 1.692999999999924 | 0 | 0 | 0 |
| 1.693999999999924 | 0 | 0 | 0 |
| 1.694999999999924 | 0 | 0 | 0 |
| 1.695999999999924 | 0 | 0 | 0 |
| 1.696999999999924 | 0 | 0 | 0 |
| 1.697999999999924 | 0 | 0 | 0 |
| 1.698999999999924 | 0 | 0 | 0 |
| 1.699999999999923 | 0 | 0 | 0 |
| 1.700999999999923 | 0 | 0 | 0 |
| 1.701999999999923 | 0 | 0 | 0 |
| 1.702999999999923 | 0 | 0 | 0 |
| 1.703999999999923 | 0 | 0 | 0 |
| 1.704999999999923 | 0 | 0 | 0 |
| 1.705999999999923 | 0 | 0 | 0 |
| 1.706999999999923 | 0 | 0 | 0 |
| 1.707999999999923 | 0 | 0 | 0 |
| 1.708999999999923 | 0 | 0 | 0 |
| 1.709999999999922 | 0 | 0 | 0 |
| 1.710999999999922 | 0 | 0 | 0 |
| 1.711999999999922 | 0 | 0 | 0 |
| 1.712999999999922 | 0 | 0 | 0 |
| 1.713999999999922 | 0 | 0 | 0 |
| 1.714999999999922 | 0 | 0 | 0 |
| 1.715999999999922 | 0 | 0 | 0 |
| 1.716999999999922 | 0 | 0 | 0 |
| 1.717999999999922 | 0 | 0 | 0 |
| 1.718999999999921 | 0 | 0 | 0 |
| 1.719999999999921 | 0 | 0 | 0 |
| 1.720999999999921 | 0 | 0 | 0 |
| 1.721999999999921 | 0 | 0 | 0 |
| 1.722999999999921 | 0 | 0 | 0 |
| 1.723999999999921 | 0 | 0 | 0 |
| 1.724999999999921 | 0 | 0 | 0 |
| 1.725999999999921 | 0 | 0 | 0 |
| 1.726999999999921 | 0 | 0 | 0 |
| 1.72799999999992 | 0 | 0 | 0 |
| 1.72899999999992 | 0 | 0 | 0 |
| 1.72999999999992 | 0 | 0 | 0 |
| 1.73099999999992 | 0 | 0 | 0 |
| 1.73199999999992 | 0 | 0 | 0 |
| 1.73299999999992 | 0 | 0 | 0 |
| 1.73399999999992 | 0 | 0 | 0 |
| 1.73499999999992 | 0 | 0 | 0 |
| 1.73599999999992 | 0 | 0 | 0 |
| 1.736999999999919 | 0 | 0 | 0 |
| 1.737999999999919 | 0 | 0 | 0 |
| 1.738999999999919 | 0 | 0 | 0 |
| 1.739999999999919 | 0 | 0 | 0 |
| 1.740999999999919 | 0 | 0 | 0 |
| 1.741999999999919 | 0 | 0 | 0 |
| 1.742999999999919 | 0 | 0 | 0 |
| 1.743999999999919 | 0 | 0 | 0 |
| 1.744999999999919 | 0 | 0 | 0 |
| 1.745999999999918 | 0 | 0 | 0 |
| 1.746999999999918 | 0 | 0 | 0 |
| 1.747999999999918 | 0 | 0 | 0 |
| 1.748999999999918 | 0 | 0 | 0 |
| 1.749999999999918 | 0 | 0 | 0 |
| 1.750999999999918 | 0 | 0 | 0 |
| 1.751999999999918 | 0 | 0 | 0 |
| 1.752999999999918 | 0 | 0 | 0 |
| 1.753999999999918 | 0 | 0 | 0 |
| 1.754999999999917 | 0 | 0 | 0 |
| 1.755999999999917 | 0 | 0 | 0 |
| 1.756999999999917 | 0 | 0 | 0 |
| 1.757999999999917 | 0 | 0 | 0 |
| 1.758999999999917 | 0 | 0 | 0 |
| 1.759999999999917 | 0 | 0 | 0 |
| 1.760999999999917 | 0 | 0 | 0 |
| 1.761999999999917 | 0 | 0 | 0 |
| 1.762999999999917 | 0 | 0 | 0 |
| 1.763999999999916 | 0 | 0 | 0 |
| 1.764999999999916 | 0 | 0 | 0 |
| 1.765999999999916 | 0 | 0 | 0 |
| 1.766999999999916 | 0 | 0 | 0 |
| 1.767999999999916 | 0 | 0 | 0 |
| 1.768999999999916 | 0 | 0 | 0 |
| 1.769999999999916 | 0 | 0 | 0 |
| 1.770999999999916 | 0 | 0 | 0 |
| 1.771999999999916 | 0 | 0 | 0 |
| 1.772999999999915 | 0 | 0 | 0 |
| 1.773999999999915 | 0 | 0 | 0 |
| 1.774999999999915 | 0 | 0 | 0 |
| 1.775999999999915 | 0 | 0 | 0 |
| 1.776999999999915 | 0 | 0 | 0 |
| 1.777999999999915 | 0 | 0 | 0 |
| 1.778999999999915 | 0 | 0 | 0 |
| 1.779999999999915 | 0 | 0 | 0 |
| 1.780999999999915 | 0 | 0 | 0 |
| 1.781999999999914 | 0 | 0 | 0 |
| 1.782999999999914 | 0 | 0 | 0 |
| 1.783999999999914 | 0 | 0 | 0 |
| 1.784999999999914 | 0 | 0 | 0 |
| 1.785999999999914 | 0 | 0 | 0 |
| 1.786999999999914 | 0 | 0 | 0 |
| 1.787999999999914 | 0 | 0 | 0 |
| 1.788999999999914 | 0 | 0 | 0 |
| 1.789999999999914 | 0 | 0 | 0 |
| 1.790999999999913 | 0 | 0 | 0 |
| 1.791999999999913 | 0 | 0 | 0 |
| 1.792999999999913 | 0 | 0 | 0 |
| 1.793999999999913 | 0 | 0 | 0 |
| 1.794999999999913 | 0 | 0 | 0 |
| 1.795999999999913 | 0 | 0 | 0 |
| 1.796999999999913 | 0 | 0 | 0 |
| 1.797999999999913 | 0 | 0 | 0 |
| 1.798999999999913 | 0 | 0 | 0 |
| 1.799999999999912 | 0 | 0 | 0 |
| 1.800999999999912 | 0 | 0 | 0 |
| 1.801999999999912 | 0 | 0 | 0 |
| 1.802999999999912 | 0 | 0 | 0 |
| 1.803999999999912 | 0 | 0 | 0 |
| 1.804999999999912 | 0 | 0 | 0 |
| 1.805999999999912 | 0 | 0 | 0 |
| 1.806999999999912 | 0 | 0 | 0 |
| 1.807999999999912 | 0 | 0 | 0 |
| 1.808999999999912 | 0 | 0 | 0 |
| 1.809999999999911 | 0 | 0 | 0 |
| 1.810999999999911 | 0 | 0 | 0 |
| 1.811999999999911 | 0 | 0 | 0 |
| 1.812999999999911 | 0 | 0 | 0 |
| 1.813999999999911 | 0 | 0 | 0 |
| 1.814999999999911 | 0 | 0 | 0 |
| 1.815999999999911 | 0 | 0 | 0 |
| 1.816999999999911 | 0 | 0 | 0 |
| 1.817999999999911 | 0 | 0 | 0 |
| 1.81899999999991 | 0 | 0 | 0 |
| 1.81999999999991 | 0 | 0 | 0 |
| 1.82099999999991 | 0 | 0 | 0 |
| 1.82199999999991 | 0 | 0 | 0 |
| 1.82299999999991 | 0 | 0 | 0 |
| 1.82399999999991 | 0 | 0 | 0 |
| 1.82499999999991 | 0 | 0 | 0 |
| 1.82599999999991 | 0 | 0 | 0 |
| 1.82699999999991 | 0 | 0 | 0 |
| 1.827999999999909 | 0 | 0 | 0 |
| 1.828999999999909 | 0 | 0 | 0 |
| 1.829999999999909 | 0 | 0 | 0 |
| 1.830999999999909 | 0 | 0 | 0 |
| 1.831999999999909 | 0 | 0 | 0 |
| 1.832999999999909 | 0 | 0 | 0 |
| 1.833999999999909 | 0 | 0 | 0 |
| 1.834999999999909 | 0 | 0 | 0 |
| 1.835999999999909 | 0 | 0 | 0 |
| 1.836999999999908 | 0 | 0 | 0 |
| 1.837999999999908 | 0 | 0 | 0 |
| 1.838999999999908 | 0 | 0 | 0 |
| 1.839999999999908 | 0 | 0 | 0 |
| 1.840999999999908 | 0 | 0 | 0 |
| 1.841999999999908 | 0 | 0 | 0 |
| 1.842999999999908 | 0 | 0 | 0 |
| 1.843999999999908 | 0 | 0 | 0 |
| 1.844999999999908 | 0 | 0 | 0 |
| 1.845999999999907 | 0 | 0 | 0 |
| 1.846999999999907 | 0 | 0 | 0 |
| 1.847999999999907 | 0 | 0 | 0 |
| 1.848999999999907 | 0 | 0 | 0 |
| 1.849999999999907 | 0 | 0 | 0 |
| 1.850999999999907 | 0 | 0 | 0 |
| 1.851999999999907 | 0 | 0 | 0 |
| 1.852999999999907 | 0 | 0 | 0 |
| 1.853999999999907 | 0 | 0 | 0 |
| 1.854999999999906 | 0 | 0 | 0 |
| 1.855999999999906 | 0 | 0 | 0 |
| 1.856999999999906 | 0 | 0 | 0 |
| 1.857999999999906 | 0 | 0 | 0 |
| 1.858999999999906 | 0 | 0 | 0 |
| 1.859999999999906 | 0 | 0 | 0 |
| 1.860999999999906 | 0 | 0 | 0 |
| 1.861999999999906 | 0 | 0 | 0 |
| 1.862999999999906 | 0 | 0 | 0 |
| 1.863999999999905 | 0 | 0 | 0 |
| 1.864999999999905 | 0 | 0 | 0 |
| 1.865999999999905 | 0 | 0 | 0 |
| 1.866999999999905 | 0 | 0 | 0 |
| 1.867999999999905 | 0 | 0 | 0 |
| 1.868999999999905 | 0 | 0 | 0 |
| 1.869999999999905 | 0 | 0 | 0 |
| 1.870999999999905 | 0 | 0 | 0 |
| 1.871999999999905 | 0 | 0 | 0 |
| 1.872999999999904 | 0 | 0 | 0 |
| 1.873999999999904 | 0 | 0 | 0 |
| 1.874999999999904 | 0 | 0 | 0 |
| 1.875999999999904 | 0 | 0 | 0 |
| 1.876999999999904 | 0 | 0 | 0 |
| 1.877999999999904 | 0 | 0 | 0 |
| 1.878999999999904 | 0 | 0 | 0 |
| 1.879999999999904 | 0 | 0 | 0 |
| 1.880999999999904 | 0 | 0 | 0 |
| 1.881999999999903 | 0 | 0 | 0 |
| 1.882999999999903 | 0 | 0 | 0 |
| 1.883999999999903 | 0 | 0 | 0 |
| 1.884999999999903 | 0 | 0 | 0 |
| 1.885999999999903 | 0 | 0 | 0 |
| 1.886999999999903 | 0 | 0 | 0 |
| 1.887999999999903 | 0 | 0 | 0 |
| 1.888999999999903 | 0 | 0 | 0 |
| 1.889999999999903 | 0 | 0 | 0 |
| 1.890999999999902 | 0 | 0 | 0 |
| 1.891999999999902 | 0 | 0 | 0 |
| 1.892999999999902 | 0 | 0 | 0 |
| 1.893999999999902 | 0 | 0 | 0 |
| 1.894999999999902 | 0 | 0 | 0 |
| 1.895999999999902 | 0 | 0 | 0 |
| 1.896999999999902 | 0 | 0 | 0 |
| 1.897999999999902 | 0 | 0 | 0 |
| 1.898999999999902 | 0 | 0 | 0 |
| 1.899999999999901 | 0 | 0 | 0 |
| 1.900999999999901 | 0 | 0 | 0 |
| 1.901999999999901 | 0 | 0 | 0 |
| 1.902999999999901 | 0 | 0 | 0 |
| 1.903999999999901 | 0 | 0 | 0 |
| 1.904999999999901 | 0 | 0 | 0 |
| 1.905999999999901 | 0 | 0 | 0 |
| 1.906999999999901 | 0 | 0 | 0 |
| 1.907999999999901 | 0 | 0 | 0 |
| 1.908999999999901 | 0 | 0 | 0 |
| 1.9099999999999 | 0 | 0 | 0 |
| 1.9109999999999 | 0 | 0 | 0 |
| 1.9119999999999 | 0 | 0 | 0 |
| 1.9129999999999 | 0 | 0 | 0 |
| 1.9139999999999 | 0 | 0 | 0 |
| 1.9149999999999 | 0 | 0 | 0 |
| 1.9159999999999 | 0 | 0 | 0 |
| 1.9169999999999 | 0 | 0 | 0 |
| 1.9179999999999 | 0 | 0 | 0 |
| 1.918999999999899 | 0 | 0 | 0 |
| 1.919999999999899 | 0 | 0 | 0 |
| 1.920999999999899 | 0 | 0 | 0 |
| 1.921999999999899 | 0 | 0 | 0 |
| 1.922999999999899 | 0 | 0 | 0 |
| 1.923999999999899 | 0 | 0 | 0 |
| 1.924999999999899 | 0 | 0 | 0 |
| 1.925999999999899 | 0 | 0 | 0 |
| 1.926999999999899 | 0 | 0 | 0 |
| 1.927999999999898 | 0 | 0 | 0 |
| 1.928999999999898 | 0 | 0 | 0 |
| 1.929999999999898 | 0 | 0 | 0 |
| 1.930999999999898 | 0 | 0 | 0 |
| 1.931999999999898 | 0 | 0 | 0 |
| 1.932999999999898 | 0 | 0 | 0 |
| 1.933999999999898 | 0 | 0 | 0 |
| 1.934999999999898 | 0 | 0 | 0 |
| 1.935999999999898 | 0 | 0 | 0 |
| 1.936999999999897 | 0 | 0 | 0 |
| 1.937999999999897 | 0 | 0 | 0 |
| 1.938999999999897 | 0 | 0 | 0 |
| 1.939999999999897 | 0 | 0 | 0 |
| 1.940999999999897 | 0 | 0 | 0 |
| 1.941999999999897 | 0 | 0 | 0 |
| 1.942999999999897 | 0 | 0 | 0 |
| 1.943999999999897 | 0 | 0 | 0 |
| 1.944999999999897 | 0 | 0 | 0 |
| 1.945999999999896 | 0 | 0 | 0 |
| 1.946999999999896 | 0 | 0 | 0 |
| 1.947999999999896 | 0 | 0 | 0 |
| 1.948999999999896 | 0 | 0 | 0 |
| 1.949999999999896 | 0 | 0 | 0 |
| 1.950999999999896 | 0 | 0 | 0 |
| 1.951999999999896 | 0 | 0 | 0 |
| 1.952999999999896 | 0 | 0 | 0 |
| 1.953999999999896 | 0 | 0 | 0 |
| 1.954999999999895 | 0 | 0 | 0 |
| 1.955999999999895 | 0 | 0 | 0 |
| 1.956999999999895 | 0 | 0 | 0 |
| 1.957999999999895 | 0 | 0 | 0 |
| 1.958999999999895 | 0 | 0 | 0 |
| 1.959999999999895 | 0 | 0 | 0 |
| 1.960999999999895 | 0 | 0 | 0 |
| 1.961999999999895 | 0 | 0 | 0 |
| 1.962999999999895 | 0 | 0 | 0 |
| 1.963999999999894 | 0 | 0 | 0 |
| 1.964999999999894 | 0 | 0 | 0 |
| 1.965999999999894 | 0 | 0 | 0 |
| 1.966999999999894 | 0 | 0 | 0 |
| 1.967999999999894 | 0 | 0 | 0 |
| 1.968999999999894 | 0 | 0 | 0 |
| 1.969999999999894 | 0 | 0 | 0 |
| 1.970999999999894 | 0 | 0 | 0 |
| 1.971999999999894 | 0 | 0 | 0 |
| 1.972999999999893 | 0 | 0 | 0 |
| 1.973999999999893 | 0 | 0 | 0 |
| 1.974999999999893 | 0 | 0 | 0 |
| 1.975999999999893 | 0 | 0 | 0 |
| 1.976999999999893 | 0 | 0 | 0 |
| 1.977999999999893 | 0 | 0 | 0 |
| 1.978999999999893 | 0 | 0 | 0 |
| 1.979999999999893 | 0 | 0 | 0 |
| 1.980999999999893 | 0 | 0 | 0 |
| 1.981999999999892 | 0 | 0 | 0 |
| 1.982999999999892 | 0 | 0 | 0 |
| 1.983999999999892 | 0 | 0 | 0 |
| 1.984999999999892 | 0 | 0 | 0 |
| 1.985999999999892 | 0 | 0 | 0 |
| 1.986999999999892 | 0 | 0 | 0 |
| 1.987999999999892 | 0 | 0 | 0 |
| 1.988999999999892 | 0 | 0 | 0 |
| 1.989999999999892 | 0 | 0 | 0 |
| 1.990999999999891 | 0 | 0 | 0 |
| 1.991999999999891 | 0 | 0 | 0 |
| 1.992999999999891 | 0 | 0 | 0 |
| 1.993999999999891 | 0 | 0 | 0 |
| 1.994999999999891 | 0 | 0 | 0 |
| 1.995999999999891 | 0 | 0 | 0 |
| 1.996999999999891 | 0 | 0 | 0 |
| 1.997999999999891 | 0 | 0 | 0 |
| 1.998999999999891 | 0 | 0 | 0 |
| 1.99999999999989 | 0 | 0 | 0 |